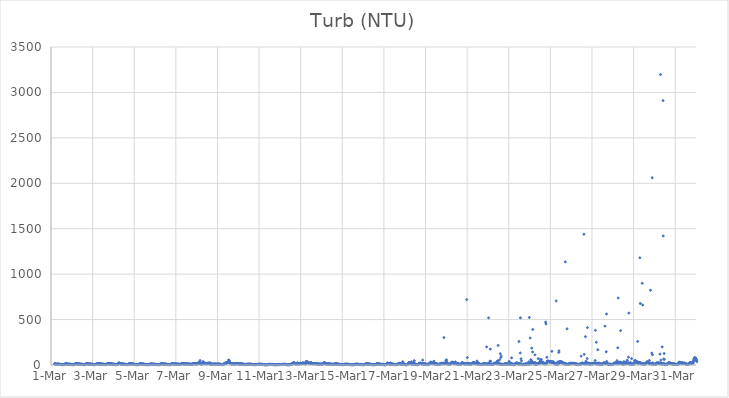
| Category | Turb (NTU) |
|---|---|
| 44621.166666666664 | 11.5 |
| 44621.177083333336 | 11.27 |
| 44621.1875 | 11.26 |
| 44621.197916666664 | 10.62 |
| 44621.208333333336 | 11.09 |
| 44621.21875 | 10.06 |
| 44621.229166666664 | 10.35 |
| 44621.239583333336 | 9.02 |
| 44621.25 | 8.74 |
| 44621.260416666664 | 7.86 |
| 44621.270833333336 | 7.4 |
| 44621.28125 | 7.75 |
| 44621.291666666664 | 8.08 |
| 44621.302083333336 | 8.36 |
| 44621.3125 | 8.98 |
| 44621.322916666664 | 9.12 |
| 44621.333333333336 | 9.79 |
| 44621.34375 | 9.59 |
| 44621.354166666664 | 9.75 |
| 44621.364583333336 | 8.4 |
| 44621.375 | 7.86 |
| 44621.385416666664 | 6.96 |
| 44621.395833333336 | 6.84 |
| 44621.40625 | 6.92 |
| 44621.416666666664 | 7.18 |
| 44621.427083333336 | 7.27 |
| 44621.4375 | 7 |
| 44621.447916666664 | 6.63 |
| 44621.458333333336 | 6.12 |
| 44621.46875 | 5.85 |
| 44621.479166666664 | 5.74 |
| 44621.489583333336 | 5.42 |
| 44621.5 | 5.26 |
| 44621.510416666664 | 4.78 |
| 44621.520833333336 | 4.65 |
| 44621.53125 | 4.64 |
| 44621.541666666664 | 5.19 |
| 44621.552083333336 | 4.26 |
| 44621.5625 | 4.34 |
| 44621.572916666664 | 4.15 |
| 44621.583333333336 | 4.18 |
| 44621.59375 | 4.02 |
| 44621.604166666664 | 4.15 |
| 44621.614583333336 | 4.47 |
| 44621.625 | 5.32 |
| 44621.635416666664 | 6.14 |
| 44621.645833333336 | 7.08 |
| 44621.65625 | 7.36 |
| 44621.666666666664 | 7.17 |
| 44621.677083333336 | 11.41 |
| 44621.6875 | 10.85 |
| 44621.697916666664 | 13.56 |
| 44621.708333333336 | 13.78 |
| 44621.71875 | 13.41 |
| 44621.729166666664 | 13.14 |
| 44621.739583333336 | 12.39 |
| 44621.75 | 12.72 |
| 44621.760416666664 | 11.3 |
| 44621.770833333336 | 10.16 |
| 44621.78125 | 9.52 |
| 44621.791666666664 | 9.02 |
| 44621.802083333336 | 8.08 |
| 44621.8125 | 8.77 |
| 44621.822916666664 | 8.82 |
| 44621.833333333336 | 8.54 |
| 44621.84375 | 8.23 |
| 44621.854166666664 | 8.05 |
| 44621.864583333336 | 7.72 |
| 44621.875 | 7.58 |
| 44621.885416666664 | 7.53 |
| 44621.895833333336 | 7.12 |
| 44621.90625 | 7.08 |
| 44621.916666666664 | 7.19 |
| 44621.927083333336 | 7.25 |
| 44621.9375 | 7.15 |
| 44621.947916666664 | 7.31 |
| 44621.958333333336 | 6.72 |
| 44621.96875 | 6.53 |
| 44621.979166666664 | 6.14 |
| 44621.989583333336 | 5.91 |
| 44622.0 | 5.55 |
| 44622.010416666664 | 5.07 |
| 44622.020833333336 | 4.63 |
| 44622.03125 | 4.59 |
| 44622.041666666664 | 4.27 |
| 44622.052083333336 | 4.54 |
| 44622.0625 | 4.33 |
| 44622.072916666664 | 4.22 |
| 44622.083333333336 | 3.94 |
| 44622.09375 | 4.53 |
| 44622.104166666664 | 5.8 |
| 44622.114583333336 | 5.73 |
| 44622.125 | 7.41 |
| 44622.135416666664 | 8.39 |
| 44622.145833333336 | 7.95 |
| 44622.15625 | 8.66 |
| 44622.166666666664 | 8.21 |
| 44622.177083333336 | 12.24 |
| 44622.1875 | 13.38 |
| 44622.197916666664 | 13.79 |
| 44622.208333333336 | 14.26 |
| 44622.21875 | 14.52 |
| 44622.229166666664 | 14.45 |
| 44622.239583333336 | 13.29 |
| 44622.25 | 12.29 |
| 44622.260416666664 | 12.23 |
| 44622.270833333336 | 11 |
| 44622.28125 | 10.53 |
| 44622.291666666664 | 9.96 |
| 44622.302083333336 | 9 |
| 44622.3125 | 8.88 |
| 44622.322916666664 | 10.13 |
| 44622.333333333336 | 10.14 |
| 44622.34375 | 10.22 |
| 44622.354166666664 | 10.72 |
| 44622.364583333336 | 11.79 |
| 44622.375 | 11.35 |
| 44622.385416666664 | 9.62 |
| 44622.395833333336 | 8.58 |
| 44622.40625 | 7.88 |
| 44622.416666666664 | 6.71 |
| 44622.427083333336 | 7.2 |
| 44622.4375 | 7.75 |
| 44622.447916666664 | 7.9 |
| 44622.458333333336 | 7.86 |
| 44622.46875 | 8.48 |
| 44622.479166666664 | 7.55 |
| 44622.489583333336 | 7.72 |
| 44622.5 | 6.83 |
| 44622.510416666664 | 6.32 |
| 44622.520833333336 | 5.69 |
| 44622.53125 | 5.13 |
| 44622.541666666664 | 4.85 |
| 44622.552083333336 | 4.87 |
| 44622.5625 | 4.51 |
| 44622.572916666664 | 4.76 |
| 44622.583333333336 | 4.31 |
| 44622.59375 | 4.36 |
| 44622.604166666664 | 4.06 |
| 44622.614583333336 | 3.98 |
| 44622.625 | 4.15 |
| 44622.635416666664 | 4.54 |
| 44622.645833333336 | 4.31 |
| 44622.65625 | 7.4 |
| 44622.666666666664 | 6.42 |
| 44622.677083333336 | 8.48 |
| 44622.6875 | 10.06 |
| 44622.697916666664 | 13.53 |
| 44622.708333333336 | 14.69 |
| 44622.71875 | 16.11 |
| 44622.729166666664 | 14.77 |
| 44622.739583333336 | 15.99 |
| 44622.75 | 15.02 |
| 44622.760416666664 | 13.7 |
| 44622.770833333336 | 13.28 |
| 44622.78125 | 11.51 |
| 44622.791666666664 | 10.31 |
| 44622.802083333336 | 10.42 |
| 44622.8125 | 9.73 |
| 44622.822916666664 | 9.88 |
| 44622.833333333336 | 8.73 |
| 44622.84375 | 8.34 |
| 44622.854166666664 | 9.05 |
| 44622.864583333336 | 9.12 |
| 44622.875 | 9.58 |
| 44622.885416666664 | 9.25 |
| 44622.895833333336 | 9.84 |
| 44622.90625 | 10.15 |
| 44622.916666666664 | 8.63 |
| 44622.927083333336 | 7.55 |
| 44622.9375 | 7.02 |
| 44622.947916666664 | 7.44 |
| 44622.958333333336 | 7.64 |
| 44622.96875 | 7.53 |
| 44622.979166666664 | 7.43 |
| 44622.989583333336 | 7.47 |
| 44623.0 | 7.04 |
| 44623.010416666664 | 6.32 |
| 44623.020833333336 | 5.99 |
| 44623.03125 | 5.67 |
| 44623.041666666664 | 4.83 |
| 44623.052083333336 | 4.64 |
| 44623.0625 | 4.54 |
| 44623.072916666664 | 4.4 |
| 44623.083333333336 | 4.21 |
| 44623.09375 | 4.26 |
| 44623.104166666664 | 4.15 |
| 44623.114583333336 | 4.04 |
| 44623.125 | 5.18 |
| 44623.135416666664 | 4.85 |
| 44623.145833333336 | 5.91 |
| 44623.15625 | 8.36 |
| 44623.166666666664 | 8.13 |
| 44623.177083333336 | 9.79 |
| 44623.1875 | 8.08 |
| 44623.197916666664 | 9.12 |
| 44623.208333333336 | 11.81 |
| 44623.21875 | 12.69 |
| 44623.229166666664 | 12.42 |
| 44623.239583333336 | 15.21 |
| 44623.25 | 14.93 |
| 44623.260416666664 | 14.81 |
| 44623.270833333336 | 13.54 |
| 44623.28125 | 14.08 |
| 44623.291666666664 | 12.9 |
| 44623.302083333336 | 13.36 |
| 44623.3125 | 12.83 |
| 44623.322916666664 | 11.65 |
| 44623.333333333336 | 10.1 |
| 44623.34375 | 9.81 |
| 44623.354166666664 | 9.62 |
| 44623.364583333336 | 11.46 |
| 44623.375 | 10.98 |
| 44623.385416666664 | 10.92 |
| 44623.395833333336 | 14.46 |
| 44623.40625 | 12.88 |
| 44623.416666666664 | 11.47 |
| 44623.427083333336 | 10.13 |
| 44623.4375 | 8.34 |
| 44623.447916666664 | 8.07 |
| 44623.458333333336 | 7.6 |
| 44623.46875 | 7.57 |
| 44623.479166666664 | 7.3 |
| 44623.489583333336 | 8.12 |
| 44623.5 | 7.89 |
| 44623.510416666664 | 7.85 |
| 44623.520833333336 | 7.37 |
| 44623.53125 | 6.95 |
| 44623.541666666664 | 6.97 |
| 44623.552083333336 | 6.22 |
| 44623.5625 | 6.03 |
| 44623.572916666664 | 5.53 |
| 44623.583333333336 | 5.26 |
| 44623.59375 | 5.18 |
| 44623.604166666664 | 5.02 |
| 44623.614583333336 | 4.47 |
| 44623.625 | 4.47 |
| 44623.635416666664 | 4.48 |
| 44623.645833333336 | 5.55 |
| 44623.65625 | 5.15 |
| 44623.666666666664 | 8.59 |
| 44623.677083333336 | 7.36 |
| 44623.6875 | 7.91 |
| 44623.697916666664 | 11.17 |
| 44623.708333333336 | 13.15 |
| 44623.71875 | 14.97 |
| 44623.729166666664 | 13.98 |
| 44623.739583333336 | 14.13 |
| 44623.75 | 15.02 |
| 44623.760416666664 | 14.78 |
| 44623.770833333336 | 14.6 |
| 44623.78125 | 14.14 |
| 44623.791666666664 | 14.26 |
| 44623.802083333336 | 13.19 |
| 44623.8125 | 12.73 |
| 44623.822916666664 | 11.52 |
| 44623.833333333336 | 12.34 |
| 44623.84375 | 12.21 |
| 44623.854166666664 | 10.45 |
| 44623.864583333336 | 10.47 |
| 44623.875 | 11.35 |
| 44623.885416666664 | 12.6 |
| 44623.895833333336 | 12.47 |
| 44623.90625 | 14.37 |
| 44623.916666666664 | 13.07 |
| 44623.927083333336 | 11.7 |
| 44623.9375 | 10.17 |
| 44623.947916666664 | 9.44 |
| 44623.958333333336 | 8.44 |
| 44623.96875 | 7.73 |
| 44623.979166666664 | 7.38 |
| 44623.989583333336 | 7.97 |
| 44624.0 | 7.94 |
| 44624.010416666664 | 8.13 |
| 44624.020833333336 | 7.81 |
| 44624.03125 | 7.72 |
| 44624.041666666664 | 7.06 |
| 44624.052083333336 | 6.65 |
| 44624.0625 | 6.23 |
| 44624.072916666664 | 5.83 |
| 44624.083333333336 | 5.09 |
| 44624.09375 | 5.45 |
| 44624.104166666664 | 5.08 |
| 44624.114583333336 | 5.03 |
| 44624.125 | 4.84 |
| 44624.135416666664 | 4.63 |
| 44624.145833333336 | 4.68 |
| 44624.15625 | 4.92 |
| 44624.166666666664 | 5.62 |
| 44624.177083333336 | 8.63 |
| 44624.1875 | 8.35 |
| 44624.197916666664 | 7.75 |
| 44624.208333333336 | 7.98 |
| 44624.21875 | 9.61 |
| 44624.229166666664 | 10.4 |
| 44624.239583333336 | 13.58 |
| 44624.25 | 19.23 |
| 44624.260416666664 | 21.74 |
| 44624.270833333336 | 21.82 |
| 44624.28125 | 19.74 |
| 44624.291666666664 | 17.58 |
| 44624.302083333336 | 16.8 |
| 44624.3125 | 15.77 |
| 44624.322916666664 | 14.65 |
| 44624.333333333336 | 14.99 |
| 44624.34375 | 12.66 |
| 44624.354166666664 | 11.54 |
| 44624.364583333336 | 11.02 |
| 44624.375 | 10 |
| 44624.385416666664 | 10.64 |
| 44624.395833333336 | 10.8 |
| 44624.40625 | 10.48 |
| 44624.416666666664 | 10.32 |
| 44624.427083333336 | 11.95 |
| 44624.4375 | 11.79 |
| 44624.447916666664 | 11.05 |
| 44624.458333333336 | 9.7 |
| 44624.46875 | 8.66 |
| 44624.479166666664 | 8.61 |
| 44624.489583333336 | 8.64 |
| 44624.5 | 8.16 |
| 44624.510416666664 | 7.91 |
| 44624.520833333336 | 8.24 |
| 44624.53125 | 8.15 |
| 44624.541666666664 | 7.88 |
| 44624.552083333336 | 7.51 |
| 44624.5625 | 6.92 |
| 44624.572916666664 | 6.62 |
| 44624.583333333336 | 6.2 |
| 44624.59375 | 5.54 |
| 44624.604166666664 | 5.43 |
| 44624.614583333336 | 5.19 |
| 44624.625 | 5.37 |
| 44624.635416666664 | 5.01 |
| 44624.645833333336 | 4.7 |
| 44624.65625 | 4.54 |
| 44624.666666666664 | 4.36 |
| 44624.677083333336 | 5.34 |
| 44624.6875 | 5.63 |
| 44624.697916666664 | 6.59 |
| 44624.708333333336 | 6.41 |
| 44624.71875 | 7.85 |
| 44624.729166666664 | 9.52 |
| 44624.739583333336 | 10.85 |
| 44624.75 | 11.52 |
| 44624.760416666664 | 12.6 |
| 44624.770833333336 | 12.27 |
| 44624.78125 | 12.53 |
| 44624.791666666664 | 14.69 |
| 44624.802083333336 | 18.13 |
| 44624.8125 | 13.02 |
| 44624.822916666664 | 13.05 |
| 44624.833333333336 | 12.81 |
| 44624.84375 | 11.13 |
| 44624.854166666664 | 10.99 |
| 44624.864583333336 | 10.48 |
| 44624.875 | 10.69 |
| 44624.885416666664 | 9.62 |
| 44624.895833333336 | 9.48 |
| 44624.90625 | 9.96 |
| 44624.916666666664 | 10.5 |
| 44624.927083333336 | 10.34 |
| 44624.9375 | 9.76 |
| 44624.947916666664 | 10.47 |
| 44624.958333333336 | 9.27 |
| 44624.96875 | 7.9 |
| 44624.979166666664 | 7.68 |
| 44624.989583333336 | 6.53 |
| 44625.0 | 6.1 |
| 44625.010416666664 | 6.26 |
| 44625.020833333336 | 5.97 |
| 44625.03125 | 5.74 |
| 44625.041666666664 | 5.68 |
| 44625.052083333336 | 5.66 |
| 44625.0625 | 5.41 |
| 44625.072916666664 | 5.37 |
| 44625.083333333336 | 5.06 |
| 44625.09375 | 4.97 |
| 44625.104166666664 | 4.46 |
| 44625.114583333336 | 4.45 |
| 44625.125 | 4.46 |
| 44625.135416666664 | 4.32 |
| 44625.145833333336 | 4.25 |
| 44625.15625 | 4.24 |
| 44625.166666666664 | 4.08 |
| 44625.177083333336 | 4.41 |
| 44625.1875 | 5.15 |
| 44625.197916666664 | 5.85 |
| 44625.208333333336 | 7.17 |
| 44625.21875 | 7.43 |
| 44625.229166666664 | 7.57 |
| 44625.239583333336 | 7.34 |
| 44625.25 | 7.43 |
| 44625.260416666664 | 7.61 |
| 44625.270833333336 | 12.53 |
| 44625.28125 | 12.81 |
| 44625.291666666664 | 13.25 |
| 44625.302083333336 | 13.53 |
| 44625.3125 | 12.77 |
| 44625.322916666664 | 12.68 |
| 44625.333333333336 | 12.48 |
| 44625.34375 | 12.14 |
| 44625.354166666664 | 11.46 |
| 44625.364583333336 | 10.14 |
| 44625.375 | 10.05 |
| 44625.385416666664 | 8.93 |
| 44625.395833333336 | 9 |
| 44625.40625 | 7.91 |
| 44625.416666666664 | 9.4 |
| 44625.427083333336 | 9.51 |
| 44625.4375 | 9.03 |
| 44625.447916666664 | 8.44 |
| 44625.458333333336 | 8.86 |
| 44625.46875 | 9.16 |
| 44625.479166666664 | 8.14 |
| 44625.489583333336 | 7.36 |
| 44625.5 | 6.48 |
| 44625.510416666664 | 5.81 |
| 44625.520833333336 | 5.38 |
| 44625.53125 | 5.16 |
| 44625.541666666664 | 4.9 |
| 44625.552083333336 | 4.72 |
| 44625.5625 | 4.95 |
| 44625.572916666664 | 5.05 |
| 44625.583333333336 | 5.06 |
| 44625.59375 | 4.77 |
| 44625.604166666664 | 4.82 |
| 44625.614583333336 | 4.48 |
| 44625.625 | 4.39 |
| 44625.635416666664 | 4.25 |
| 44625.645833333336 | 4.08 |
| 44625.65625 | 4.26 |
| 44625.666666666664 | 4 |
| 44625.677083333336 | 3.67 |
| 44625.6875 | 3.83 |
| 44625.697916666664 | 4.41 |
| 44625.708333333336 | 4.45 |
| 44625.71875 | 5.39 |
| 44625.729166666664 | 5.85 |
| 44625.739583333336 | 6.31 |
| 44625.75 | 6.91 |
| 44625.760416666664 | 8.62 |
| 44625.770833333336 | 10.64 |
| 44625.78125 | 10.44 |
| 44625.791666666664 | 9.61 |
| 44625.802083333336 | 10.18 |
| 44625.8125 | 10.04 |
| 44625.822916666664 | 10.04 |
| 44625.833333333336 | 9.22 |
| 44625.84375 | 9.44 |
| 44625.854166666664 | 9.28 |
| 44625.864583333336 | 9.17 |
| 44625.875 | 8.09 |
| 44625.885416666664 | 8.03 |
| 44625.895833333336 | 7.98 |
| 44625.90625 | 7.47 |
| 44625.916666666664 | 7.4 |
| 44625.927083333336 | 9.1 |
| 44625.9375 | 8.92 |
| 44625.947916666664 | 8.42 |
| 44625.958333333336 | 8.29 |
| 44625.96875 | 8.74 |
| 44625.979166666664 | 8.09 |
| 44625.989583333336 | 7.44 |
| 44626.0 | 6.73 |
| 44626.010416666664 | 6.02 |
| 44626.020833333336 | 5.85 |
| 44626.03125 | 5.58 |
| 44626.041666666664 | 5.48 |
| 44626.052083333336 | 5.26 |
| 44626.0625 | 5.49 |
| 44626.072916666664 | 5.69 |
| 44626.083333333336 | 5.41 |
| 44626.09375 | 5.77 |
| 44626.104166666664 | 5.24 |
| 44626.114583333336 | 5.02 |
| 44626.125 | 4.78 |
| 44626.135416666664 | 4.52 |
| 44626.145833333336 | 4.27 |
| 44626.15625 | 4.25 |
| 44626.166666666664 | 4.16 |
| 44626.177083333336 | 4.05 |
| 44626.1875 | 4.03 |
| 44626.197916666664 | 3.9 |
| 44626.208333333336 | 3.9 |
| 44626.21875 | 4.31 |
| 44626.229166666664 | 6.67 |
| 44626.239583333336 | 7.37 |
| 44626.25 | 8.54 |
| 44626.260416666664 | 9.59 |
| 44626.270833333336 | 9.76 |
| 44626.28125 | 8.66 |
| 44626.291666666664 | 11.56 |
| 44626.302083333336 | 11.98 |
| 44626.3125 | 14.29 |
| 44626.322916666664 | 14.75 |
| 44626.333333333336 | 14.61 |
| 44626.34375 | 12.95 |
| 44626.354166666664 | 12.4 |
| 44626.364583333336 | 11.82 |
| 44626.375 | 11.31 |
| 44626.385416666664 | 11.67 |
| 44626.395833333336 | 10.78 |
| 44626.40625 | 10.05 |
| 44626.416666666664 | 9.66 |
| 44626.427083333336 | 8.69 |
| 44626.4375 | 8.26 |
| 44626.447916666664 | 8.65 |
| 44626.458333333336 | 9.65 |
| 44626.46875 | 9.23 |
| 44626.479166666664 | 9.28 |
| 44626.489583333336 | 9.28 |
| 44626.5 | 9.25 |
| 44626.510416666664 | 9.34 |
| 44626.520833333336 | 8.65 |
| 44626.53125 | 8.24 |
| 44626.541666666664 | 7.65 |
| 44626.552083333336 | 6.87 |
| 44626.5625 | 6.5 |
| 44626.572916666664 | 5.91 |
| 44626.583333333336 | 5.7 |
| 44626.59375 | 5.57 |
| 44626.604166666664 | 5.53 |
| 44626.614583333336 | 5.25 |
| 44626.625 | 5.21 |
| 44626.635416666664 | 5.09 |
| 44626.645833333336 | 4.85 |
| 44626.65625 | 4.87 |
| 44626.666666666664 | 4.31 |
| 44626.677083333336 | 4.4 |
| 44626.6875 | 4.4 |
| 44626.697916666664 | 4.1 |
| 44626.708333333336 | 4.07 |
| 44626.71875 | 4.18 |
| 44626.729166666664 | 4.42 |
| 44626.739583333336 | 4.91 |
| 44626.75 | 7.01 |
| 44626.760416666664 | 6.99 |
| 44626.770833333336 | 6.62 |
| 44626.78125 | 7.78 |
| 44626.791666666664 | 12.42 |
| 44626.802083333336 | 15.33 |
| 44626.8125 | 15.93 |
| 44626.822916666664 | 19.02 |
| 44626.833333333336 | 14.06 |
| 44626.84375 | 12.92 |
| 44626.854166666664 | 12.64 |
| 44626.864583333336 | 12.95 |
| 44626.875 | 12.73 |
| 44626.885416666664 | 10.78 |
| 44626.895833333336 | 12.03 |
| 44626.90625 | 11.06 |
| 44626.916666666664 | 10.74 |
| 44626.927083333336 | 10.11 |
| 44626.9375 | 9.58 |
| 44626.947916666664 | 9.52 |
| 44626.958333333336 | 10.23 |
| 44626.96875 | 10.58 |
| 44626.979166666664 | 10.3 |
| 44626.989583333336 | 10.54 |
| 44627.0 | 10.52 |
| 44627.010416666664 | 11.38 |
| 44627.020833333336 | 10.72 |
| 44627.03125 | 9.62 |
| 44627.041666666664 | 9.64 |
| 44627.052083333336 | 8.67 |
| 44627.0625 | 8.09 |
| 44627.072916666664 | 7.84 |
| 44627.083333333336 | 7.62 |
| 44627.09375 | 8.25 |
| 44627.104166666664 | 8.5 |
| 44627.114583333336 | 8.62 |
| 44627.125 | 8.76 |
| 44627.135416666664 | 8.06 |
| 44627.145833333336 | 7.6 |
| 44627.15625 | 7.47 |
| 44627.166666666664 | 7.71 |
| 44627.177083333336 | 6.72 |
| 44627.1875 | 6.13 |
| 44627.197916666664 | 6.19 |
| 44627.208333333336 | 5.73 |
| 44627.21875 | 5.52 |
| 44627.229166666664 | 5.64 |
| 44627.239583333336 | 7.52 |
| 44627.25 | 9.05 |
| 44627.260416666664 | 10.43 |
| 44627.270833333336 | 10.63 |
| 44627.28125 | 13.36 |
| 44627.291666666664 | 15.01 |
| 44627.302083333336 | 17.08 |
| 44627.3125 | 16.48 |
| 44627.322916666664 | 14.99 |
| 44627.333333333336 | 14.73 |
| 44627.34375 | 13.85 |
| 44627.354166666664 | 12.26 |
| 44627.364583333336 | 11.52 |
| 44627.375 | 12.06 |
| 44627.385416666664 | 11.55 |
| 44627.395833333336 | 13.43 |
| 44627.40625 | 10.39 |
| 44627.416666666664 | 11.66 |
| 44627.427083333336 | 11.02 |
| 44627.4375 | 10.98 |
| 44627.447916666664 | 11.01 |
| 44627.458333333336 | 10.93 |
| 44627.46875 | 10.42 |
| 44627.479166666664 | 10.26 |
| 44627.489583333336 | 10.6 |
| 44627.5 | 10.41 |
| 44627.510416666664 | 9.96 |
| 44627.520833333336 | 9.65 |
| 44627.53125 | 10.41 |
| 44627.541666666664 | 10.43 |
| 44627.552083333336 | 10.45 |
| 44627.5625 | 10.44 |
| 44627.572916666664 | 10.57 |
| 44627.583333333336 | 10.06 |
| 44627.59375 | 9.56 |
| 44627.604166666664 | 9.51 |
| 44627.614583333336 | 9.75 |
| 44627.625 | 9.76 |
| 44627.635416666664 | 9.95 |
| 44627.645833333336 | 8.92 |
| 44627.65625 | 8.16 |
| 44627.666666666664 | 8.1 |
| 44627.677083333336 | 8.48 |
| 44627.6875 | 7.97 |
| 44627.697916666664 | 7.71 |
| 44627.708333333336 | 7.32 |
| 44627.71875 | 6.74 |
| 44627.729166666664 | 5.76 |
| 44627.739583333336 | 6.7 |
| 44627.75 | 6.66 |
| 44627.760416666664 | 7.84 |
| 44627.770833333336 | 8.93 |
| 44627.78125 | 9.84 |
| 44627.791666666664 | 11.17 |
| 44627.802083333336 | 12.2 |
| 44627.8125 | 10.61 |
| 44627.822916666664 | 10.75 |
| 44627.833333333336 | 11.75 |
| 44627.84375 | 13.96 |
| 44627.854166666664 | 14.08 |
| 44627.864583333336 | 15.2 |
| 44627.875 | 14.46 |
| 44627.885416666664 | 14.52 |
| 44627.895833333336 | 13.85 |
| 44627.90625 | 13.91 |
| 44627.916666666664 | 14.04 |
| 44627.927083333336 | 13.68 |
| 44627.9375 | 12.8 |
| 44627.947916666664 | 12.26 |
| 44627.958333333336 | 12.69 |
| 44627.96875 | 14.2 |
| 44627.979166666664 | 13.65 |
| 44627.989583333336 | 12.02 |
| 44628.0 | 11.59 |
| 44628.010416666664 | 12.31 |
| 44628.020833333336 | 12.81 |
| 44628.03125 | 12.61 |
| 44628.041666666664 | 13.35 |
| 44628.052083333336 | 15.85 |
| 44628.0625 | 18.67 |
| 44628.072916666664 | 23.66 |
| 44628.083333333336 | 23.48 |
| 44628.09375 | 24.72 |
| 44628.104166666664 | 25.13 |
| 44628.114583333336 | 24.02 |
| 44628.125 | 24.48 |
| 44628.135416666664 | 24.7 |
| 44628.145833333336 | 20.63 |
| 44628.15625 | 19.4 |
| 44628.166666666664 | 49.35 |
| 44628.177083333336 | 12.37 |
| 44628.1875 | 13.45 |
| 44628.197916666664 | 13.07 |
| 44628.208333333336 | 12.92 |
| 44628.21875 | 12.35 |
| 44628.229166666664 | 9.91 |
| 44628.239583333336 | 9.52 |
| 44628.25 | 9.67 |
| 44628.260416666664 | 9.86 |
| 44628.270833333336 | 13.43 |
| 44628.28125 | 17.11 |
| 44628.291666666664 | 25.42 |
| 44628.302083333336 | 34.94 |
| 44628.3125 | 33.53 |
| 44628.322916666664 | 31.15 |
| 44628.333333333336 | 26.38 |
| 44628.34375 | 22.9 |
| 44628.354166666664 | 20.33 |
| 44628.364583333336 | 16.73 |
| 44628.375 | 15.42 |
| 44628.385416666664 | 16.32 |
| 44628.395833333336 | 16.53 |
| 44628.40625 | 16.56 |
| 44628.416666666664 | 15.49 |
| 44628.427083333336 | 17.78 |
| 44628.4375 | 17.72 |
| 44628.447916666664 | 16.16 |
| 44628.458333333336 | 14.85 |
| 44628.46875 | 13.06 |
| 44628.479166666664 | 13.1 |
| 44628.489583333336 | 14.46 |
| 44628.5 | 13.62 |
| 44628.510416666664 | 14.96 |
| 44628.520833333336 | 17.22 |
| 44628.53125 | 18.79 |
| 44628.541666666664 | 17.53 |
| 44628.552083333336 | 15.99 |
| 44628.5625 | 20.34 |
| 44628.572916666664 | 18.25 |
| 44628.583333333336 | 19.83 |
| 44628.59375 | 17.95 |
| 44628.604166666664 | 14.7 |
| 44628.614583333336 | 13.59 |
| 44628.625 | 12.5 |
| 44628.635416666664 | 25.61 |
| 44628.645833333336 | 12.04 |
| 44628.65625 | 12.08 |
| 44628.666666666664 | 11.77 |
| 44628.677083333336 | 10.81 |
| 44628.6875 | 11.27 |
| 44628.697916666664 | 10.44 |
| 44628.708333333336 | 10.08 |
| 44628.71875 | 9.65 |
| 44628.729166666664 | 9.59 |
| 44628.739583333336 | 9.19 |
| 44628.75 | 8.5 |
| 44628.760416666664 | 8.31 |
| 44628.770833333336 | 7.58 |
| 44628.78125 | 7.58 |
| 44628.791666666664 | 7.51 |
| 44628.802083333336 | 7.61 |
| 44628.8125 | 8.21 |
| 44628.822916666664 | 7.89 |
| 44628.833333333336 | 8.54 |
| 44628.84375 | 9.44 |
| 44628.854166666664 | 10.35 |
| 44628.864583333336 | 10.93 |
| 44628.875 | 10.66 |
| 44628.885416666664 | 9.59 |
| 44628.895833333336 | 9.28 |
| 44628.90625 | 8.82 |
| 44628.916666666664 | 8.52 |
| 44628.927083333336 | 8.64 |
| 44628.9375 | 8.7 |
| 44628.947916666664 | 8.94 |
| 44628.958333333336 | 9.59 |
| 44628.96875 | 9.74 |
| 44628.979166666664 | 8.86 |
| 44628.989583333336 | 8.67 |
| 44629.0 | 8.65 |
| 44629.010416666664 | 8.26 |
| 44629.020833333336 | 8.69 |
| 44629.03125 | 9.07 |
| 44629.041666666664 | 8.81 |
| 44629.052083333336 | 8.14 |
| 44629.0625 | 8.95 |
| 44629.072916666664 | 9.47 |
| 44629.083333333336 | 9.13 |
| 44629.09375 | 8.8 |
| 44629.104166666664 | 8.3 |
| 44629.114583333336 | 8.02 |
| 44629.125 | 8.03 |
| 44629.135416666664 | 7.51 |
| 44629.145833333336 | 6.92 |
| 44629.15625 | 6.46 |
| 44629.166666666664 | 5.74 |
| 44629.177083333336 | 6.14 |
| 44629.1875 | 5.83 |
| 44629.197916666664 | 5.36 |
| 44629.208333333336 | 5.06 |
| 44629.21875 | 5.31 |
| 44629.229166666664 | 5.06 |
| 44629.239583333336 | 4.73 |
| 44629.25 | 5.09 |
| 44629.260416666664 | 4.67 |
| 44629.270833333336 | 4.3 |
| 44629.28125 | 4.41 |
| 44629.291666666664 | 6.88 |
| 44629.302083333336 | 6.52 |
| 44629.3125 | 12.8 |
| 44629.322916666664 | 11.41 |
| 44629.333333333336 | 12.7 |
| 44629.34375 | 14.83 |
| 44629.354166666664 | 20.43 |
| 44629.364583333336 | 19.48 |
| 44629.375 | 19.43 |
| 44629.385416666664 | 19.87 |
| 44629.395833333336 | 18.68 |
| 44629.40625 | 19.19 |
| 44629.416666666664 | 21.38 |
| 44629.427083333336 | 20.7 |
| 44629.4375 | 24.22 |
| 44629.447916666664 | 26.05 |
| 44629.458333333336 | 29.16 |
| 44629.46875 | 26.2 |
| 44629.479166666664 | 27.23 |
| 44629.489583333336 | 24.91 |
| 44629.5 | 24.59 |
| 44629.510416666664 | 31.48 |
| 44629.520833333336 | 33.77 |
| 44629.53125 | 37.91 |
| 44629.541666666664 | 55.38 |
| 44629.552083333336 | 52.92 |
| 44629.5625 | 45.28 |
| 44629.572916666664 | 41.42 |
| 44629.583333333336 | 28.11 |
| 44629.59375 | 25.99 |
| 44629.604166666664 | 22.99 |
| 44629.614583333336 | 21.33 |
| 44629.625 | 17.63 |
| 44629.635416666664 | 16.31 |
| 44629.645833333336 | 15.01 |
| 44629.65625 | 14.09 |
| 44629.666666666664 | 13.32 |
| 44629.677083333336 | 12.56 |
| 44629.6875 | 12.98 |
| 44629.697916666664 | 12.46 |
| 44629.708333333336 | 12.7 |
| 44629.71875 | 13.75 |
| 44629.729166666664 | 13.37 |
| 44629.739583333336 | 12.5 |
| 44629.75 | 11.17 |
| 44629.760416666664 | 11.44 |
| 44629.770833333336 | 9.91 |
| 44629.78125 | 9.21 |
| 44629.791666666664 | 9.33 |
| 44629.802083333336 | 10.71 |
| 44629.8125 | 10.54 |
| 44629.822916666664 | 13.07 |
| 44629.833333333336 | 13.4 |
| 44629.84375 | 15.98 |
| 44629.854166666664 | 14.55 |
| 44629.864583333336 | 13.8 |
| 44629.875 | 14.54 |
| 44629.885416666664 | 13.86 |
| 44629.895833333336 | 12.57 |
| 44629.90625 | 14.59 |
| 44629.916666666664 | 12.9 |
| 44629.927083333336 | 16.67 |
| 44629.9375 | 16.6 |
| 44629.947916666664 | 15.64 |
| 44629.958333333336 | 14.99 |
| 44629.96875 | 15.12 |
| 44629.979166666664 | 14.26 |
| 44629.989583333336 | 13.95 |
| 44630.0 | 13.22 |
| 44630.010416666664 | 11.75 |
| 44630.020833333336 | 11.91 |
| 44630.03125 | 11.49 |
| 44630.041666666664 | 11.8 |
| 44630.052083333336 | 10.88 |
| 44630.0625 | 10.64 |
| 44630.072916666664 | 10.9 |
| 44630.083333333336 | 10.39 |
| 44630.09375 | 10.79 |
| 44630.104166666664 | 11.16 |
| 44630.114583333336 | 10.2 |
| 44630.125 | 12.43 |
| 44630.135416666664 | 12.39 |
| 44630.145833333336 | 11.2 |
| 44630.15625 | 10.97 |
| 44630.166666666664 | 11.73 |
| 44630.177083333336 | 11.56 |
| 44630.1875 | 10.27 |
| 44630.197916666664 | 9.91 |
| 44630.208333333336 | 9.74 |
| 44630.21875 | 8.84 |
| 44630.229166666664 | 8.19 |
| 44630.239583333336 | 7.59 |
| 44630.25 | 7.63 |
| 44630.260416666664 | 7.01 |
| 44630.270833333336 | 6.95 |
| 44630.28125 | 6.26 |
| 44630.291666666664 | 6.77 |
| 44630.302083333336 | 6.03 |
| 44630.3125 | 5.48 |
| 44630.322916666664 | 5.46 |
| 44630.333333333336 | 5.27 |
| 44630.34375 | 5.95 |
| 44630.354166666664 | 5.48 |
| 44630.364583333336 | 6.08 |
| 44630.375 | 6.4 |
| 44630.385416666664 | 6.56 |
| 44630.395833333336 | 6.66 |
| 44630.40625 | 6.54 |
| 44630.416666666664 | 6.56 |
| 44630.427083333336 | 6.69 |
| 44630.4375 | 6.96 |
| 44630.447916666664 | 7.27 |
| 44630.458333333336 | 7.97 |
| 44630.46875 | 7.74 |
| 44630.479166666664 | 7.79 |
| 44630.489583333336 | 7.79 |
| 44630.5 | 7.99 |
| 44630.510416666664 | 8.17 |
| 44630.520833333336 | 8.06 |
| 44630.53125 | 7.98 |
| 44630.541666666664 | 8.1 |
| 44630.552083333336 | 8.11 |
| 44630.5625 | 8.09 |
| 44630.572916666664 | 8.24 |
| 44630.583333333336 | 7.5 |
| 44630.59375 | 7.59 |
| 44630.604166666664 | 7.71 |
| 44630.614583333336 | 7.82 |
| 44630.625 | 7.56 |
| 44630.635416666664 | 7.49 |
| 44630.645833333336 | 6.7 |
| 44630.65625 | 6.41 |
| 44630.666666666664 | 5.99 |
| 44630.677083333336 | 5.51 |
| 44630.6875 | 5.32 |
| 44630.697916666664 | 5.15 |
| 44630.708333333336 | 5 |
| 44630.71875 | 4.83 |
| 44630.729166666664 | 4.85 |
| 44630.739583333336 | 4.65 |
| 44630.75 | 4.58 |
| 44630.760416666664 | 4.59 |
| 44630.770833333336 | 4.97 |
| 44630.78125 | 4.93 |
| 44630.791666666664 | 4.89 |
| 44630.802083333336 | 4.61 |
| 44630.8125 | 4.43 |
| 44630.822916666664 | 4.28 |
| 44630.833333333336 | 4.36 |
| 44630.84375 | 4.3 |
| 44630.854166666664 | 4.78 |
| 44630.864583333336 | 5.25 |
| 44630.875 | 5.43 |
| 44630.885416666664 | 5.35 |
| 44630.895833333336 | 5.81 |
| 44630.90625 | 5.28 |
| 44630.916666666664 | 6.02 |
| 44630.927083333336 | 6.44 |
| 44630.9375 | 6.68 |
| 44630.947916666664 | 6.68 |
| 44630.958333333336 | 6.95 |
| 44630.96875 | 7.16 |
| 44630.979166666664 | 7.12 |
| 44630.989583333336 | 7.24 |
| 44631.0 | 7.01 |
| 44631.010416666664 | 7.13 |
| 44631.020833333336 | 7.25 |
| 44631.03125 | 7.3 |
| 44631.041666666664 | 7.35 |
| 44631.052083333336 | 7.07 |
| 44631.0625 | 7.32 |
| 44631.072916666664 | 6.73 |
| 44631.083333333336 | 6.6 |
| 44631.09375 | 6.98 |
| 44631.104166666664 | 6.36 |
| 44631.114583333336 | 6.69 |
| 44631.125 | 7.61 |
| 44631.135416666664 | 6.55 |
| 44631.145833333336 | 7.27 |
| 44631.15625 | 6.84 |
| 44631.166666666664 | 6.27 |
| 44631.177083333336 | 5.91 |
| 44631.1875 | 5.62 |
| 44631.197916666664 | 5.69 |
| 44631.208333333336 | 4.89 |
| 44631.21875 | 4.6 |
| 44631.229166666664 | 4.51 |
| 44631.239583333336 | 4.26 |
| 44631.25 | 4.09 |
| 44631.260416666664 | 3.86 |
| 44631.270833333336 | 3.95 |
| 44631.28125 | 3.84 |
| 44631.291666666664 | 3.52 |
| 44631.302083333336 | 3.55 |
| 44631.3125 | 3.51 |
| 44631.322916666664 | 3.58 |
| 44631.333333333336 | 3.53 |
| 44631.34375 | 3.52 |
| 44631.354166666664 | 3.48 |
| 44631.364583333336 | 3.34 |
| 44631.375 | 3.38 |
| 44631.385416666664 | 3.46 |
| 44631.395833333336 | 3.73 |
| 44631.40625 | 3.65 |
| 44631.416666666664 | 4.08 |
| 44631.427083333336 | 4.15 |
| 44631.4375 | 4.37 |
| 44631.447916666664 | 4.62 |
| 44631.458333333336 | 5.02 |
| 44631.46875 | 5.23 |
| 44631.479166666664 | 5.07 |
| 44631.489583333336 | 6.66 |
| 44631.5 | 6.12 |
| 44631.510416666664 | 6.84 |
| 44631.520833333336 | 7.01 |
| 44631.53125 | 8.17 |
| 44631.541666666664 | 6.54 |
| 44631.552083333336 | 6.57 |
| 44631.5625 | 6.63 |
| 44631.572916666664 | 6.41 |
| 44631.583333333336 | 6.01 |
| 44631.59375 | 5.77 |
| 44631.604166666664 | 5.91 |
| 44631.614583333336 | 5.87 |
| 44631.625 | 5.79 |
| 44631.635416666664 | 5.76 |
| 44631.645833333336 | 5.72 |
| 44631.65625 | 5.47 |
| 44631.666666666664 | 5.2 |
| 44631.677083333336 | 4.98 |
| 44631.6875 | 4.86 |
| 44631.697916666664 | 4.61 |
| 44631.708333333336 | 4.74 |
| 44631.71875 | 4.86 |
| 44631.729166666664 | 4.58 |
| 44631.739583333336 | 4.08 |
| 44631.75 | 3.95 |
| 44631.760416666664 | 4.13 |
| 44631.770833333336 | 3.68 |
| 44631.78125 | 3.33 |
| 44631.791666666664 | 3.6 |
| 44631.802083333336 | 3.61 |
| 44631.8125 | 3.46 |
| 44631.822916666664 | 5.12 |
| 44631.833333333336 | 4.93 |
| 44631.84375 | 4.1 |
| 44631.854166666664 | 4.73 |
| 44631.864583333336 | 4.1 |
| 44631.875 | 3.62 |
| 44631.885416666664 | 3.8 |
| 44631.895833333336 | 4.27 |
| 44631.90625 | 4.21 |
| 44631.916666666664 | 4.01 |
| 44631.927083333336 | 4.8 |
| 44631.9375 | 4.98 |
| 44631.947916666664 | 4.74 |
| 44631.958333333336 | 4.66 |
| 44631.96875 | 4.44 |
| 44631.979166666664 | 4.7 |
| 44631.989583333336 | 4.98 |
| 44632.0 | 5.22 |
| 44632.010416666664 | 5.37 |
| 44632.020833333336 | 5.78 |
| 44632.03125 | 5.34 |
| 44632.041666666664 | 5.51 |
| 44632.052083333336 | 5.22 |
| 44632.0625 | 5.26 |
| 44632.072916666664 | 5.1 |
| 44632.083333333336 | 5.25 |
| 44632.09375 | 5.24 |
| 44632.104166666664 | 5 |
| 44632.114583333336 | 5.41 |
| 44632.125 | 5.65 |
| 44632.135416666664 | 5.64 |
| 44632.145833333336 | 5.77 |
| 44632.15625 | 5.97 |
| 44632.166666666664 | 6.56 |
| 44632.177083333336 | 6.97 |
| 44632.1875 | 6.43 |
| 44632.197916666664 | 6.98 |
| 44632.208333333336 | 7.32 |
| 44632.21875 | 7.46 |
| 44632.229166666664 | 6.4 |
| 44632.239583333336 | 6.4 |
| 44632.25 | 6.07 |
| 44632.260416666664 | 6.06 |
| 44632.270833333336 | 5.54 |
| 44632.28125 | 5.27 |
| 44632.291666666664 | 4.96 |
| 44632.302083333336 | 4.81 |
| 44632.3125 | 4.39 |
| 44632.322916666664 | 4.4 |
| 44632.333333333336 | 4.54 |
| 44632.34375 | 4.4 |
| 44632.354166666664 | 4.2 |
| 44632.364583333336 | 3.99 |
| 44632.375 | 4.21 |
| 44632.385416666664 | 3.97 |
| 44632.395833333336 | 4.11 |
| 44632.40625 | 3.82 |
| 44632.416666666664 | 3.67 |
| 44632.427083333336 | 3.71 |
| 44632.4375 | 3.75 |
| 44632.447916666664 | 3.8 |
| 44632.458333333336 | 4.12 |
| 44632.46875 | 4.19 |
| 44632.479166666664 | 4.45 |
| 44632.489583333336 | 4.54 |
| 44632.5 | 5.22 |
| 44632.510416666664 | 5.29 |
| 44632.520833333336 | 5.02 |
| 44632.53125 | 5.1 |
| 44632.541666666664 | 5.21 |
| 44632.552083333336 | 5.34 |
| 44632.5625 | 5.18 |
| 44632.572916666664 | 5.18 |
| 44632.583333333336 | 15.84 |
| 44632.59375 | 15.9 |
| 44632.604166666664 | 17.97 |
| 44632.614583333336 | 17.45 |
| 44632.625 | 18.56 |
| 44632.635416666664 | 19.94 |
| 44632.645833333336 | 20.87 |
| 44632.65625 | 23.74 |
| 44632.666666666664 | 21.61 |
| 44632.677083333336 | 24.68 |
| 44632.6875 | 24.21 |
| 44632.697916666664 | 22.52 |
| 44632.708333333336 | 19.98 |
| 44632.71875 | 20.13 |
| 44632.729166666664 | 15.93 |
| 44632.739583333336 | 13.49 |
| 44632.75 | 11.4 |
| 44632.760416666664 | 11.97 |
| 44632.770833333336 | 11.32 |
| 44632.78125 | 11.26 |
| 44632.791666666664 | 10 |
| 44632.802083333336 | 10.15 |
| 44632.8125 | 11.68 |
| 44632.822916666664 | 13 |
| 44632.833333333336 | 17.52 |
| 44632.84375 | 22.23 |
| 44632.854166666664 | 18.75 |
| 44632.864583333336 | 18.19 |
| 44632.875 | 16.38 |
| 44632.885416666664 | 11.69 |
| 44632.895833333336 | 11.86 |
| 44632.90625 | 12.64 |
| 44632.916666666664 | 12.46 |
| 44632.927083333336 | 13.26 |
| 44632.9375 | 12.27 |
| 44632.947916666664 | 13.66 |
| 44632.958333333336 | 12.45 |
| 44632.96875 | 12.62 |
| 44632.979166666664 | 16.1 |
| 44632.989583333336 | 19.4 |
| 44633.0 | 18.43 |
| 44633.010416666664 | 18.84 |
| 44633.020833333336 | 14.8 |
| 44633.03125 | 15.03 |
| 44633.041666666664 | 15.68 |
| 44633.052083333336 | 16.3 |
| 44633.0625 | 15.34 |
| 44633.072916666664 | 19.12 |
| 44633.083333333336 | 19.21 |
| 44633.09375 | 22.36 |
| 44633.104166666664 | 21.53 |
| 44633.114583333336 | 20.59 |
| 44633.125 | 19.61 |
| 44633.135416666664 | 19.41 |
| 44633.145833333336 | 16.89 |
| 44633.15625 | 14.75 |
| 44633.166666666664 | 15.44 |
| 44633.177083333336 | 16.17 |
| 44633.1875 | 15.38 |
| 44633.197916666664 | 16.21 |
| 44633.208333333336 | 15.04 |
| 44633.21875 | 12.29 |
| 44633.229166666664 | 12.67 |
| 44633.239583333336 | 14.14 |
| 44633.25 | 17.65 |
| 44633.260416666664 | 36.12 |
| 44633.270833333336 | 37.98 |
| 44633.28125 | 38.68 |
| 44633.291666666664 | 36.24 |
| 44633.302083333336 | 32.94 |
| 44633.3125 | 32.6 |
| 44633.322916666664 | 32.14 |
| 44633.333333333336 | 30.37 |
| 44633.34375 | 28.2 |
| 44633.354166666664 | 25.67 |
| 44633.364583333336 | 22.32 |
| 44633.375 | 23.81 |
| 44633.385416666664 | 23.69 |
| 44633.395833333336 | 21.96 |
| 44633.40625 | 20.78 |
| 44633.416666666664 | 21.54 |
| 44633.427083333336 | 17.16 |
| 44633.4375 | 16.35 |
| 44633.447916666664 | 17.16 |
| 44633.458333333336 | 15.44 |
| 44633.46875 | 17 |
| 44633.479166666664 | 18.91 |
| 44633.489583333336 | 25.81 |
| 44633.5 | 27.88 |
| 44633.510416666664 | 21.81 |
| 44633.520833333336 | 19.92 |
| 44633.53125 | 18.1 |
| 44633.541666666664 | 17.29 |
| 44633.552083333336 | 16.4 |
| 44633.5625 | 15.74 |
| 44633.572916666664 | 14.63 |
| 44633.583333333336 | 14.98 |
| 44633.59375 | 15.27 |
| 44633.604166666664 | 15.42 |
| 44633.614583333336 | 14.94 |
| 44633.625 | 15.5 |
| 44633.635416666664 | 15.47 |
| 44633.645833333336 | 15.73 |
| 44633.65625 | 16.1 |
| 44633.666666666664 | 15.86 |
| 44633.677083333336 | 15.47 |
| 44633.6875 | 15.65 |
| 44633.697916666664 | 15.86 |
| 44633.708333333336 | 15.71 |
| 44633.71875 | 15.05 |
| 44633.729166666664 | 14.46 |
| 44633.739583333336 | 14.46 |
| 44633.75 | 12.95 |
| 44633.760416666664 | 13.12 |
| 44633.770833333336 | 12.84 |
| 44633.78125 | 12.54 |
| 44633.791666666664 | 12.41 |
| 44633.802083333336 | 12.59 |
| 44633.8125 | 11.64 |
| 44633.822916666664 | 10.84 |
| 44633.833333333336 | 11.34 |
| 44633.84375 | 10.41 |
| 44633.854166666664 | 10.05 |
| 44633.864583333336 | 9.43 |
| 44633.875 | 9.36 |
| 44633.885416666664 | 8.84 |
| 44633.895833333336 | 8.83 |
| 44633.90625 | 8.54 |
| 44633.916666666664 | 8.81 |
| 44633.927083333336 | 8.67 |
| 44633.9375 | 9.48 |
| 44633.947916666664 | 9.35 |
| 44633.958333333336 | 8.74 |
| 44633.96875 | 8.43 |
| 44633.979166666664 | 8.12 |
| 44633.989583333336 | 8.41 |
| 44634.0 | 7.71 |
| 44634.010416666664 | 7.51 |
| 44634.020833333336 | 7.34 |
| 44634.03125 | 8.43 |
| 44634.041666666664 | 9.07 |
| 44634.052083333336 | 10.56 |
| 44634.0625 | 10.29 |
| 44634.072916666664 | 12.5 |
| 44634.083333333336 | 14.71 |
| 44634.09375 | 17.3 |
| 44634.104166666664 | 18.65 |
| 44634.114583333336 | 21.02 |
| 44634.125 | 21 |
| 44634.135416666664 | 26.73 |
| 44634.145833333336 | 18.22 |
| 44634.15625 | 21.02 |
| 44634.166666666664 | 25.87 |
| 44634.177083333336 | 15.87 |
| 44634.1875 | 15.45 |
| 44634.197916666664 | 15.04 |
| 44634.208333333336 | 14.24 |
| 44634.21875 | 14.79 |
| 44634.229166666664 | 12.49 |
| 44634.239583333336 | 11.48 |
| 44634.25 | 11.28 |
| 44634.260416666664 | 10.96 |
| 44634.270833333336 | 11.27 |
| 44634.28125 | 10.13 |
| 44634.291666666664 | 10.91 |
| 44634.302083333336 | 10.91 |
| 44634.3125 | 10.93 |
| 44634.322916666664 | 11.38 |
| 44634.333333333336 | 10.99 |
| 44634.34375 | 10.03 |
| 44634.354166666664 | 9.76 |
| 44634.364583333336 | 9.66 |
| 44634.375 | 9.91 |
| 44634.385416666664 | 10.75 |
| 44634.395833333336 | 10.13 |
| 44634.40625 | 9.36 |
| 44634.416666666664 | 9.77 |
| 44634.427083333336 | 9.54 |
| 44634.4375 | 9.17 |
| 44634.447916666664 | 8.55 |
| 44634.458333333336 | 8.37 |
| 44634.46875 | 8.37 |
| 44634.479166666664 | 8.32 |
| 44634.489583333336 | 8.15 |
| 44634.5 | 7.92 |
| 44634.510416666664 | 7.36 |
| 44634.520833333336 | 7.3 |
| 44634.53125 | 6.53 |
| 44634.541666666664 | 6.95 |
| 44634.552083333336 | 6.84 |
| 44634.5625 | 7.17 |
| 44634.572916666664 | 7.49 |
| 44634.583333333336 | 7.1 |
| 44634.59375 | 8.05 |
| 44634.604166666664 | 8.6 |
| 44634.614583333336 | 8.8 |
| 44634.625 | 9.03 |
| 44634.635416666664 | 9.32 |
| 44634.645833333336 | 9.88 |
| 44634.65625 | 10.85 |
| 44634.666666666664 | 11.38 |
| 44634.677083333336 | 10.53 |
| 44634.6875 | 10.9 |
| 44634.697916666664 | 11.1 |
| 44634.708333333336 | 11.16 |
| 44634.71875 | 12.2 |
| 44634.729166666664 | 12.13 |
| 44634.739583333336 | 12.44 |
| 44634.75 | 11.1 |
| 44634.760416666664 | 10.26 |
| 44634.770833333336 | 10.1 |
| 44634.78125 | 8.64 |
| 44634.791666666664 | 8.54 |
| 44634.802083333336 | 8.29 |
| 44634.8125 | 8.31 |
| 44634.822916666664 | 7.57 |
| 44634.833333333336 | 7.22 |
| 44634.84375 | 7.03 |
| 44634.854166666664 | 6.53 |
| 44634.864583333336 | 6.99 |
| 44634.875 | 6.26 |
| 44634.885416666664 | 6.18 |
| 44634.895833333336 | 6.39 |
| 44634.90625 | 5.87 |
| 44634.916666666664 | 5.74 |
| 44634.927083333336 | 5.43 |
| 44634.9375 | 5.42 |
| 44634.947916666664 | 5.18 |
| 44634.958333333336 | 5.35 |
| 44634.96875 | 5.53 |
| 44634.979166666664 | 5.04 |
| 44634.989583333336 | 4.66 |
| 44635.0 | 4.19 |
| 44635.010416666664 | 4.65 |
| 44635.020833333336 | 4.57 |
| 44635.03125 | 4.6 |
| 44635.041666666664 | 5.05 |
| 44635.052083333336 | 4.78 |
| 44635.0625 | 4.91 |
| 44635.072916666664 | 5.41 |
| 44635.083333333336 | 5.95 |
| 44635.09375 | 6.24 |
| 44635.104166666664 | 6.31 |
| 44635.114583333336 | 8.48 |
| 44635.125 | 7.5 |
| 44635.135416666664 | 7.47 |
| 44635.145833333336 | 7.44 |
| 44635.15625 | 7.79 |
| 44635.166666666664 | 7.94 |
| 44635.177083333336 | 7.97 |
| 44635.1875 | 8.45 |
| 44635.197916666664 | 8.37 |
| 44635.208333333336 | 7.59 |
| 44635.21875 | 7.67 |
| 44635.229166666664 | 7.87 |
| 44635.239583333336 | 7.26 |
| 44635.25 | 7.28 |
| 44635.260416666664 | 6.76 |
| 44635.270833333336 | 6.49 |
| 44635.28125 | 6.49 |
| 44635.291666666664 | 6.5 |
| 44635.302083333336 | 6.53 |
| 44635.3125 | 6.14 |
| 44635.322916666664 | 5.6 |
| 44635.333333333336 | 5.42 |
| 44635.34375 | 5.48 |
| 44635.354166666664 | 5.03 |
| 44635.364583333336 | 4.54 |
| 44635.375 | 4.48 |
| 44635.385416666664 | 4.42 |
| 44635.395833333336 | 4.5 |
| 44635.40625 | 4.14 |
| 44635.416666666664 | 3.99 |
| 44635.427083333336 | 4.12 |
| 44635.4375 | 3.99 |
| 44635.447916666664 | 4.34 |
| 44635.458333333336 | 4.07 |
| 44635.46875 | 3.84 |
| 44635.479166666664 | 3.62 |
| 44635.489583333336 | 3.73 |
| 44635.5 | 3.65 |
| 44635.510416666664 | 3.61 |
| 44635.520833333336 | 3.48 |
| 44635.53125 | 3.47 |
| 44635.541666666664 | 6.37 |
| 44635.552083333336 | 3.85 |
| 44635.5625 | 3.99 |
| 44635.572916666664 | 4.01 |
| 44635.583333333336 | 4.21 |
| 44635.59375 | 5.54 |
| 44635.604166666664 | 6.18 |
| 44635.614583333336 | 6.84 |
| 44635.625 | 6.85 |
| 44635.635416666664 | 7.58 |
| 44635.645833333336 | 7.65 |
| 44635.65625 | 7.47 |
| 44635.666666666664 | 7.32 |
| 44635.677083333336 | 7.47 |
| 44635.6875 | 7.75 |
| 44635.697916666664 | 7.87 |
| 44635.708333333336 | 8.07 |
| 44635.71875 | 7.96 |
| 44635.729166666664 | 6.78 |
| 44635.739583333336 | 7.1 |
| 44635.75 | 6.64 |
| 44635.760416666664 | 6.82 |
| 44635.770833333336 | 6.49 |
| 44635.78125 | 6.12 |
| 44635.791666666664 | 6.26 |
| 44635.802083333336 | 6.07 |
| 44635.8125 | 5.65 |
| 44635.822916666664 | 5.3 |
| 44635.833333333336 | 4.98 |
| 44635.84375 | 4.82 |
| 44635.854166666664 | 4.67 |
| 44635.864583333336 | 4.52 |
| 44635.875 | 4.51 |
| 44635.885416666664 | 4.77 |
| 44635.895833333336 | 4.58 |
| 44635.90625 | 4.58 |
| 44635.916666666664 | 4.55 |
| 44635.927083333336 | 4.97 |
| 44635.9375 | 4.62 |
| 44635.947916666664 | 4.77 |
| 44635.958333333336 | 4.74 |
| 44635.96875 | 4.35 |
| 44635.979166666664 | 4.11 |
| 44635.989583333336 | 4.19 |
| 44636.0 | 3.91 |
| 44636.010416666664 | 4.06 |
| 44636.020833333336 | 3.98 |
| 44636.03125 | 3.53 |
| 44636.041666666664 | 3.45 |
| 44636.052083333336 | 3.57 |
| 44636.0625 | 4.73 |
| 44636.072916666664 | 5.98 |
| 44636.083333333336 | 6.82 |
| 44636.09375 | 6.67 |
| 44636.104166666664 | 8.23 |
| 44636.114583333336 | 8.71 |
| 44636.125 | 10.17 |
| 44636.135416666664 | 11.52 |
| 44636.145833333336 | 12.75 |
| 44636.15625 | 13.21 |
| 44636.166666666664 | 12.57 |
| 44636.177083333336 | 12.23 |
| 44636.1875 | 11.74 |
| 44636.197916666664 | 11.84 |
| 44636.208333333336 | 12.07 |
| 44636.21875 | 11.55 |
| 44636.229166666664 | 10.58 |
| 44636.239583333336 | 10.32 |
| 44636.25 | 9.23 |
| 44636.260416666664 | 9.33 |
| 44636.270833333336 | 8.81 |
| 44636.28125 | 8.86 |
| 44636.291666666664 | 9.12 |
| 44636.302083333336 | 9.1 |
| 44636.3125 | 8.76 |
| 44636.322916666664 | 8.93 |
| 44636.333333333336 | 8.34 |
| 44636.34375 | 8.04 |
| 44636.354166666664 | 6.63 |
| 44636.364583333336 | 6.52 |
| 44636.375 | 5.39 |
| 44636.385416666664 | 5.31 |
| 44636.395833333336 | 5.67 |
| 44636.40625 | 5.16 |
| 44636.416666666664 | 4.65 |
| 44636.427083333336 | 5.06 |
| 44636.4375 | 5.67 |
| 44636.447916666664 | 4.32 |
| 44636.458333333336 | 4.33 |
| 44636.46875 | 4.36 |
| 44636.479166666664 | 4.17 |
| 44636.489583333336 | 3.91 |
| 44636.5 | 4.14 |
| 44636.510416666664 | 3.8 |
| 44636.520833333336 | 3.31 |
| 44636.53125 | 3.57 |
| 44636.541666666664 | 3.82 |
| 44636.552083333336 | 3.58 |
| 44636.5625 | 3.96 |
| 44636.572916666664 | 3.74 |
| 44636.583333333336 | 4.37 |
| 44636.59375 | 5.96 |
| 44636.604166666664 | 5.87 |
| 44636.614583333336 | 5.88 |
| 44636.625 | 5.87 |
| 44636.635416666664 | 8.79 |
| 44636.645833333336 | 12.86 |
| 44636.65625 | 14.99 |
| 44636.666666666664 | 13.4 |
| 44636.677083333336 | 15.52 |
| 44636.6875 | 14.88 |
| 44636.697916666664 | 13.84 |
| 44636.708333333336 | 12.32 |
| 44636.71875 | 11.68 |
| 44636.729166666664 | 10.98 |
| 44636.739583333336 | 10.96 |
| 44636.75 | 10.15 |
| 44636.760416666664 | 9.65 |
| 44636.770833333336 | 9.16 |
| 44636.78125 | 8.99 |
| 44636.791666666664 | 9.34 |
| 44636.802083333336 | 8.52 |
| 44636.8125 | 8.84 |
| 44636.822916666664 | 8.08 |
| 44636.833333333336 | 7.87 |
| 44636.84375 | 8.97 |
| 44636.854166666664 | 6.91 |
| 44636.864583333336 | 6.47 |
| 44636.875 | 6.03 |
| 44636.885416666664 | 6.4 |
| 44636.895833333336 | 6.19 |
| 44636.90625 | 5.98 |
| 44636.916666666664 | 6.37 |
| 44636.927083333336 | 7.04 |
| 44636.9375 | 6.46 |
| 44636.947916666664 | 6.19 |
| 44636.958333333336 | 5.23 |
| 44636.96875 | 6.38 |
| 44636.979166666664 | 4.49 |
| 44636.989583333336 | 3.96 |
| 44637.0 | 3.65 |
| 44637.010416666664 | 3.33 |
| 44637.020833333336 | 3.85 |
| 44637.03125 | 3.19 |
| 44637.041666666664 | 3.49 |
| 44637.052083333336 | 3.45 |
| 44637.0625 | 3.46 |
| 44637.072916666664 | 3.76 |
| 44637.083333333336 | 4.34 |
| 44637.09375 | 4.97 |
| 44637.104166666664 | 6.65 |
| 44637.114583333336 | 6.7 |
| 44637.125 | 7.5 |
| 44637.135416666664 | 10.71 |
| 44637.145833333336 | 14 |
| 44637.15625 | 19.62 |
| 44637.166666666664 | 15.76 |
| 44637.177083333336 | 20.35 |
| 44637.1875 | 21.89 |
| 44637.197916666664 | 18.3 |
| 44637.208333333336 | 17.7 |
| 44637.21875 | 16.22 |
| 44637.229166666664 | 14.38 |
| 44637.239583333336 | 13.44 |
| 44637.25 | 13.06 |
| 44637.260416666664 | 12.15 |
| 44637.270833333336 | 11.45 |
| 44637.28125 | 11.51 |
| 44637.291666666664 | 10.5 |
| 44637.302083333336 | 10.78 |
| 44637.3125 | 10.71 |
| 44637.322916666664 | 23.97 |
| 44637.333333333336 | 9.97 |
| 44637.34375 | 9.73 |
| 44637.354166666664 | 10.31 |
| 44637.364583333336 | 9.04 |
| 44637.375 | 8.77 |
| 44637.385416666664 | 8.54 |
| 44637.395833333336 | 8.19 |
| 44637.40625 | 8.79 |
| 44637.416666666664 | 9.53 |
| 44637.427083333336 | 8.74 |
| 44637.4375 | 8.7 |
| 44637.447916666664 | 6.96 |
| 44637.458333333336 | 7.36 |
| 44637.46875 | 6.96 |
| 44637.479166666664 | 7.68 |
| 44637.489583333336 | 5.51 |
| 44637.5 | 4.94 |
| 44637.510416666664 | 4.97 |
| 44637.520833333336 | 4.86 |
| 44637.53125 | 4.91 |
| 44637.541666666664 | 4.58 |
| 44637.552083333336 | 6.29 |
| 44637.5625 | 4.29 |
| 44637.572916666664 | 4.01 |
| 44637.583333333336 | 3.76 |
| 44637.59375 | 4.43 |
| 44637.604166666664 | 4.9 |
| 44637.614583333336 | 4.71 |
| 44637.625 | 5.32 |
| 44637.635416666664 | 5.7 |
| 44637.645833333336 | 7.11 |
| 44637.65625 | 8.72 |
| 44637.666666666664 | 9.41 |
| 44637.677083333336 | 9.94 |
| 44637.6875 | 10.56 |
| 44637.697916666664 | 10.62 |
| 44637.708333333336 | 11.21 |
| 44637.71875 | 12.01 |
| 44637.729166666664 | 14.12 |
| 44637.739583333336 | 17.01 |
| 44637.75 | 18.21 |
| 44637.760416666664 | 16.85 |
| 44637.770833333336 | 14.26 |
| 44637.78125 | 12.04 |
| 44637.791666666664 | 11.35 |
| 44637.802083333336 | 11.35 |
| 44637.8125 | 10.18 |
| 44637.822916666664 | 10.17 |
| 44637.833333333336 | 9.2 |
| 44637.84375 | 9.83 |
| 44637.854166666664 | 9.77 |
| 44637.864583333336 | 9.15 |
| 44637.875 | 9.4 |
| 44637.885416666664 | 9.4 |
| 44637.895833333336 | 8.12 |
| 44637.90625 | 35.84 |
| 44637.916666666664 | 10.67 |
| 44637.927083333336 | 11.9 |
| 44637.9375 | 11.88 |
| 44637.947916666664 | 11.71 |
| 44637.958333333336 | 8.35 |
| 44637.96875 | 7.95 |
| 44637.979166666664 | 6.28 |
| 44637.989583333336 | 10.63 |
| 44638.0 | 7.43 |
| 44638.010416666664 | 4.9 |
| 44638.020833333336 | 4.32 |
| 44638.03125 | 3.93 |
| 44638.041666666664 | 3.88 |
| 44638.052083333336 | 4.22 |
| 44638.0625 | 4.23 |
| 44638.072916666664 | 3.9 |
| 44638.083333333336 | 3.71 |
| 44638.09375 | 3.73 |
| 44638.104166666664 | 3.92 |
| 44638.114583333336 | 5.17 |
| 44638.125 | 5.87 |
| 44638.135416666664 | 7.52 |
| 44638.145833333336 | 8.29 |
| 44638.15625 | 9.46 |
| 44638.166666666664 | 11.5 |
| 44638.177083333336 | 15.13 |
| 44638.1875 | 17.32 |
| 44638.197916666664 | 25.08 |
| 44638.208333333336 | 26.66 |
| 44638.21875 | 24.44 |
| 44638.229166666664 | 26.33 |
| 44638.239583333336 | 23.84 |
| 44638.25 | 21.39 |
| 44638.260416666664 | 19.33 |
| 44638.270833333336 | 19.57 |
| 44638.28125 | 16.94 |
| 44638.291666666664 | 15.11 |
| 44638.302083333336 | 14.13 |
| 44638.3125 | 13.05 |
| 44638.322916666664 | 35.05 |
| 44638.333333333336 | 11.14 |
| 44638.34375 | 12.01 |
| 44638.354166666664 | 12.02 |
| 44638.364583333336 | 14.73 |
| 44638.375 | 14.63 |
| 44638.385416666664 | 11.21 |
| 44638.395833333336 | 12.74 |
| 44638.40625 | 9.06 |
| 44638.416666666664 | 11.43 |
| 44638.427083333336 | 11.54 |
| 44638.4375 | 6.52 |
| 44638.447916666664 | 32.23 |
| 44638.458333333336 | 47.94 |
| 44638.46875 | 11.06 |
| 44638.479166666664 | 8.41 |
| 44638.489583333336 | 10 |
| 44638.5 | 8.67 |
| 44638.510416666664 | 9.17 |
| 44638.520833333336 | 7.18 |
| 44638.53125 | 6.36 |
| 44638.541666666664 | 5.7 |
| 44638.552083333336 | 5.35 |
| 44638.5625 | 5.2 |
| 44638.572916666664 | 5.26 |
| 44638.583333333336 | 5.1 |
| 44638.59375 | 5.18 |
| 44638.604166666664 | 4.63 |
| 44638.614583333336 | 4.74 |
| 44638.625 | 5.19 |
| 44638.635416666664 | 6.18 |
| 44638.645833333336 | 7.17 |
| 44638.65625 | 9.99 |
| 44638.666666666664 | 14.5 |
| 44638.677083333336 | 15.34 |
| 44638.6875 | 12.59 |
| 44638.697916666664 | 14.4 |
| 44638.708333333336 | 16.88 |
| 44638.71875 | 17.66 |
| 44638.729166666664 | 19.2 |
| 44638.739583333336 | 20.82 |
| 44638.75 | 19.35 |
| 44638.760416666664 | 18.27 |
| 44638.770833333336 | 18.52 |
| 44638.78125 | 16.66 |
| 44638.791666666664 | 15.09 |
| 44638.802083333336 | 13.74 |
| 44638.8125 | 14.1 |
| 44638.822916666664 | 13.52 |
| 44638.833333333336 | 11.96 |
| 44638.84375 | 12.02 |
| 44638.854166666664 | 14.23 |
| 44638.864583333336 | 53.12 |
| 44638.875 | 11.78 |
| 44638.885416666664 | 13.05 |
| 44638.895833333336 | 10.58 |
| 44638.90625 | 11.22 |
| 44638.916666666664 | 13.54 |
| 44638.927083333336 | 11.82 |
| 44638.9375 | 10.85 |
| 44638.947916666664 | 12.74 |
| 44638.958333333336 | 10.22 |
| 44638.96875 | 12.36 |
| 44638.979166666664 | 7.98 |
| 44638.989583333336 | 15.21 |
| 44639.0 | 8.93 |
| 44639.010416666664 | 7.75 |
| 44639.020833333336 | 10.19 |
| 44639.03125 | 8.68 |
| 44639.041666666664 | 5.84 |
| 44639.052083333336 | 5.96 |
| 44639.0625 | 5.25 |
| 44639.072916666664 | 5.32 |
| 44639.083333333336 | 5.37 |
| 44639.09375 | 7.22 |
| 44639.104166666664 | 6.19 |
| 44639.114583333336 | 4.54 |
| 44639.125 | 4.54 |
| 44639.135416666664 | 4.4 |
| 44639.145833333336 | 8.53 |
| 44639.15625 | 9 |
| 44639.166666666664 | 9.06 |
| 44639.177083333336 | 12.46 |
| 44639.1875 | 16.52 |
| 44639.197916666664 | 11.17 |
| 44639.208333333336 | 14.38 |
| 44639.21875 | 19.82 |
| 44639.229166666664 | 20.99 |
| 44639.239583333336 | 26.65 |
| 44639.25 | 32.69 |
| 44639.260416666664 | 26.97 |
| 44639.270833333336 | 26.52 |
| 44639.28125 | 27.97 |
| 44639.291666666664 | 25.81 |
| 44639.302083333336 | 25.38 |
| 44639.3125 | 22.32 |
| 44639.322916666664 | 19.53 |
| 44639.333333333336 | 16.42 |
| 44639.34375 | 17.58 |
| 44639.354166666664 | 14.92 |
| 44639.364583333336 | 18.39 |
| 44639.375 | 18.06 |
| 44639.385416666664 | 17.1 |
| 44639.395833333336 | 18.72 |
| 44639.40625 | 41.79 |
| 44639.416666666664 | 13.69 |
| 44639.427083333336 | 12.53 |
| 44639.4375 | 14.45 |
| 44639.447916666664 | 13.33 |
| 44639.458333333336 | 12.78 |
| 44639.46875 | 13.62 |
| 44639.479166666664 | 16.5 |
| 44639.489583333336 | 10.76 |
| 44639.5 | 10.39 |
| 44639.510416666664 | 9.26 |
| 44639.520833333336 | 14.2 |
| 44639.53125 | 15.89 |
| 44639.541666666664 | 9.74 |
| 44639.552083333336 | 11.41 |
| 44639.5625 | 7.28 |
| 44639.572916666664 | 7.02 |
| 44639.583333333336 | 6.69 |
| 44639.59375 | 6.17 |
| 44639.604166666664 | 6.63 |
| 44639.614583333336 | 5.65 |
| 44639.625 | 5.41 |
| 44639.635416666664 | 5.43 |
| 44639.645833333336 | 4.85 |
| 44639.65625 | 6.72 |
| 44639.666666666664 | 8 |
| 44639.677083333336 | 9.92 |
| 44639.6875 | 10.3 |
| 44639.697916666664 | 12.07 |
| 44639.708333333336 | 10.98 |
| 44639.71875 | 10.85 |
| 44639.729166666664 | 11.37 |
| 44639.739583333336 | 13.26 |
| 44639.75 | 14.91 |
| 44639.760416666664 | 16.83 |
| 44639.770833333336 | 17.41 |
| 44639.78125 | 18.27 |
| 44639.791666666664 | 18.4 |
| 44639.802083333336 | 16.36 |
| 44639.8125 | 17.08 |
| 44639.822916666664 | 15.08 |
| 44639.833333333336 | 14.59 |
| 44639.84375 | 16.02 |
| 44639.854166666664 | 13.83 |
| 44639.864583333336 | 17.72 |
| 44639.875 | 20.66 |
| 44639.885416666664 | 301.86 |
| 44639.895833333336 | 11.82 |
| 44639.90625 | 19.12 |
| 44639.916666666664 | 16.72 |
| 44639.927083333336 | 15.89 |
| 44639.9375 | 14.67 |
| 44639.947916666664 | 16.17 |
| 44639.958333333336 | 17.28 |
| 44639.96875 | 17.32 |
| 44639.979166666664 | 51.52 |
| 44639.989583333336 | 30.12 |
| 44640.0 | 25.87 |
| 44640.010416666664 | 56.42 |
| 44640.020833333336 | 15.02 |
| 44640.03125 | 31.54 |
| 44640.041666666664 | 18.12 |
| 44640.052083333336 | 11.52 |
| 44640.0625 | 11.61 |
| 44640.072916666664 | 9.58 |
| 44640.083333333336 | 8.82 |
| 44640.09375 | 8.78 |
| 44640.104166666664 | 10.15 |
| 44640.114583333336 | 7.47 |
| 44640.125 | 7.39 |
| 44640.135416666664 | 6.53 |
| 44640.145833333336 | 5.96 |
| 44640.15625 | 5.89 |
| 44640.166666666664 | 6.06 |
| 44640.177083333336 | 10.19 |
| 44640.1875 | 11.94 |
| 44640.197916666664 | 10.26 |
| 44640.208333333336 | 17.15 |
| 44640.21875 | 19.21 |
| 44640.229166666664 | 22.92 |
| 44640.239583333336 | 24.76 |
| 44640.25 | 21.59 |
| 44640.260416666664 | 30.12 |
| 44640.270833333336 | 27.75 |
| 44640.28125 | 29.28 |
| 44640.291666666664 | 30.78 |
| 44640.302083333336 | 27.6 |
| 44640.3125 | 24.41 |
| 44640.322916666664 | 27.72 |
| 44640.333333333336 | 24.4 |
| 44640.34375 | 24.23 |
| 44640.354166666664 | 21.42 |
| 44640.364583333336 | 18.92 |
| 44640.375 | 16.84 |
| 44640.385416666664 | 14.44 |
| 44640.395833333336 | 15.66 |
| 44640.40625 | 14.87 |
| 44640.416666666664 | 16.4 |
| 44640.427083333336 | 19.1 |
| 44640.4375 | 33.93 |
| 44640.447916666664 | 18.94 |
| 44640.458333333336 | 15.47 |
| 44640.46875 | 13.42 |
| 44640.479166666664 | 15.18 |
| 44640.489583333336 | 10.83 |
| 44640.5 | 12.52 |
| 44640.510416666664 | 10.34 |
| 44640.520833333336 | 14.6 |
| 44640.53125 | 12.7 |
| 44640.541666666664 | 12.83 |
| 44640.552083333336 | 16.15 |
| 44640.5625 | 11.82 |
| 44640.572916666664 | 18.17 |
| 44640.583333333336 | 12.7 |
| 44640.59375 | 9.29 |
| 44640.604166666664 | 8.55 |
| 44640.614583333336 | 7.41 |
| 44640.625 | 7.96 |
| 44640.635416666664 | 6.86 |
| 44640.645833333336 | 6.15 |
| 44640.65625 | 6.25 |
| 44640.666666666664 | 6.01 |
| 44640.677083333336 | 6.05 |
| 44640.6875 | 7.18 |
| 44640.697916666664 | 7.72 |
| 44640.708333333336 | 8.59 |
| 44640.71875 | 10.82 |
| 44640.729166666664 | 13.91 |
| 44640.739583333336 | 13.69 |
| 44640.75 | 16.38 |
| 44640.760416666664 | 27.97 |
| 44640.770833333336 | 21.62 |
| 44640.78125 | 21.78 |
| 44640.791666666664 | 20.46 |
| 44640.802083333336 | 19.21 |
| 44640.8125 | 18.47 |
| 44640.822916666664 | 16.92 |
| 44640.833333333336 | 16.03 |
| 44640.84375 | 15.58 |
| 44640.854166666664 | 14.43 |
| 44640.864583333336 | 13.95 |
| 44640.875 | 12.09 |
| 44640.885416666664 | 11.71 |
| 44640.895833333336 | 11.56 |
| 44640.90625 | 11.63 |
| 44640.916666666664 | 12.23 |
| 44640.927083333336 | 11.12 |
| 44640.9375 | 15.28 |
| 44640.947916666664 | 14.59 |
| 44640.958333333336 | 11.47 |
| 44640.96875 | 12.22 |
| 44640.979166666664 | 719.77 |
| 44640.989583333336 | 12.26 |
| 44641.0 | 20.61 |
| 44641.010416666664 | 81.72 |
| 44641.020833333336 | 12.31 |
| 44641.03125 | 9.8 |
| 44641.041666666664 | 11.96 |
| 44641.052083333336 | 14.54 |
| 44641.0625 | 13.86 |
| 44641.072916666664 | 11.99 |
| 44641.083333333336 | 13.26 |
| 44641.09375 | 10.98 |
| 44641.104166666664 | 14.06 |
| 44641.114583333336 | 14.02 |
| 44641.125 | 10.51 |
| 44641.135416666664 | 10.64 |
| 44641.145833333336 | 9.73 |
| 44641.15625 | 8.92 |
| 44641.166666666664 | 7.11 |
| 44641.177083333336 | 7.42 |
| 44641.1875 | 6.88 |
| 44641.197916666664 | 8.07 |
| 44641.208333333336 | 10.42 |
| 44641.21875 | 12.93 |
| 44641.229166666664 | 15.65 |
| 44641.239583333336 | 18.39 |
| 44641.25 | 18.03 |
| 44641.260416666664 | 19.48 |
| 44641.270833333336 | 23.67 |
| 44641.28125 | 20.74 |
| 44641.291666666664 | 25.33 |
| 44641.302083333336 | 26.93 |
| 44641.3125 | 25.45 |
| 44641.322916666664 | 23.96 |
| 44641.333333333336 | 23.37 |
| 44641.34375 | 19.29 |
| 44641.354166666664 | 19.87 |
| 44641.364583333336 | 20.59 |
| 44641.375 | 19.31 |
| 44641.385416666664 | 17.46 |
| 44641.395833333336 | 16.08 |
| 44641.40625 | 14.26 |
| 44641.416666666664 | 12.9 |
| 44641.427083333336 | 17.19 |
| 44641.4375 | 15.26 |
| 44641.447916666664 | 16.08 |
| 44641.458333333336 | 18.85 |
| 44641.46875 | 43.52 |
| 44641.479166666664 | 16.83 |
| 44641.489583333336 | 34.03 |
| 44641.5 | 14.84 |
| 44641.510416666664 | 11.02 |
| 44641.520833333336 | 22.03 |
| 44641.53125 | 8.81 |
| 44641.541666666664 | 10.46 |
| 44641.552083333336 | 9.21 |
| 44641.5625 | 19.15 |
| 44641.572916666664 | 9.97 |
| 44641.583333333336 | 9.13 |
| 44641.59375 | 9.07 |
| 44641.604166666664 | 7.42 |
| 44641.614583333336 | 8.67 |
| 44641.625 | 6.57 |
| 44641.635416666664 | 6.13 |
| 44641.645833333336 | 7.31 |
| 44641.65625 | 6.12 |
| 44641.666666666664 | 6.31 |
| 44641.677083333336 | 5.64 |
| 44641.6875 | 5.47 |
| 44641.697916666664 | 5.61 |
| 44641.708333333336 | 6.6 |
| 44641.71875 | 6.83 |
| 44641.729166666664 | 7.38 |
| 44641.739583333336 | 9.53 |
| 44641.75 | 8.03 |
| 44641.760416666664 | 9.93 |
| 44641.770833333336 | 10.93 |
| 44641.78125 | 12.28 |
| 44641.791666666664 | 10.7 |
| 44641.802083333336 | 10.73 |
| 44641.8125 | 11.97 |
| 44641.822916666664 | 10.22 |
| 44641.833333333336 | 9.21 |
| 44641.84375 | 11.84 |
| 44641.854166666664 | 11.35 |
| 44641.864583333336 | 12.05 |
| 44641.875 | 11.89 |
| 44641.885416666664 | 12.12 |
| 44641.895833333336 | 12.57 |
| 44641.90625 | 11.86 |
| 44641.916666666664 | 9.74 |
| 44641.927083333336 | 9.38 |
| 44641.9375 | 199.62 |
| 44641.947916666664 | 8.38 |
| 44641.958333333336 | 9.46 |
| 44641.96875 | 11.37 |
| 44641.979166666664 | 12.27 |
| 44641.989583333336 | 9.89 |
| 44642.0 | 10.3 |
| 44642.010416666664 | 11.78 |
| 44642.020833333336 | 7.66 |
| 44642.03125 | 519.06 |
| 44642.041666666664 | 10.75 |
| 44642.052083333336 | 8.79 |
| 44642.0625 | 18.89 |
| 44642.072916666664 | 14.95 |
| 44642.083333333336 | 10.18 |
| 44642.09375 | 42.43 |
| 44642.104166666664 | 9.3 |
| 44642.114583333336 | 175.1 |
| 44642.125 | 8.1 |
| 44642.135416666664 | 40 |
| 44642.145833333336 | 8.24 |
| 44642.15625 | 7.17 |
| 44642.166666666664 | 6.8 |
| 44642.177083333336 | 5.98 |
| 44642.1875 | 5.9 |
| 44642.197916666664 | 5.66 |
| 44642.208333333336 | 5.48 |
| 44642.21875 | 5.63 |
| 44642.229166666664 | 5.76 |
| 44642.239583333336 | 8.92 |
| 44642.25 | 9.31 |
| 44642.260416666664 | 11.96 |
| 44642.270833333336 | 13.52 |
| 44642.28125 | 16.85 |
| 44642.291666666664 | 14.3 |
| 44642.302083333336 | 17.73 |
| 44642.3125 | 17.69 |
| 44642.322916666664 | 18.09 |
| 44642.333333333336 | 20.41 |
| 44642.34375 | 20.18 |
| 44642.354166666664 | 18.79 |
| 44642.364583333336 | 18.65 |
| 44642.375 | 19.16 |
| 44642.385416666664 | 16.69 |
| 44642.395833333336 | 16.21 |
| 44642.40625 | 18.29 |
| 44642.416666666664 | 16.52 |
| 44642.427083333336 | 15.61 |
| 44642.4375 | 14.8 |
| 44642.447916666664 | 41.64 |
| 44642.458333333336 | 12.22 |
| 44642.46875 | 44.68 |
| 44642.479166666664 | 16.31 |
| 44642.489583333336 | 215.39 |
| 44642.5 | 18.14 |
| 44642.510416666664 | 16.4 |
| 44642.520833333336 | 13.82 |
| 44642.53125 | 12.85 |
| 44642.541666666664 | 20.05 |
| 44642.552083333336 | 10.63 |
| 44642.5625 | 57.85 |
| 44642.572916666664 | 7.71 |
| 44642.583333333336 | 9.18 |
| 44642.59375 | 124.5 |
| 44642.604166666664 | 5.98 |
| 44642.614583333336 | 9.18 |
| 44642.625 | 83.59 |
| 44642.635416666664 | 99.37 |
| 44642.645833333336 | 9.32 |
| 44642.65625 | 7.08 |
| 44642.666666666664 | 6.14 |
| 44642.677083333336 | 8.63 |
| 44642.6875 | 6.01 |
| 44642.697916666664 | 5.63 |
| 44642.708333333336 | 5.04 |
| 44642.71875 | 5.03 |
| 44642.729166666664 | 5.22 |
| 44642.739583333336 | 5.57 |
| 44642.75 | 6.79 |
| 44642.760416666664 | 6.7 |
| 44642.770833333336 | 7.61 |
| 44642.78125 | 8.46 |
| 44642.791666666664 | 8.53 |
| 44642.802083333336 | 9.43 |
| 44642.8125 | 10.28 |
| 44642.822916666664 | 10.75 |
| 44642.833333333336 | 11.58 |
| 44642.84375 | 12.27 |
| 44642.854166666664 | 13.14 |
| 44642.864583333336 | 12.87 |
| 44642.875 | 12.49 |
| 44642.885416666664 | 12.11 |
| 44642.895833333336 | 11.22 |
| 44642.90625 | 10.73 |
| 44642.916666666664 | 10.77 |
| 44642.927083333336 | 11.41 |
| 44642.9375 | 10.56 |
| 44642.947916666664 | 8.04 |
| 44642.958333333336 | 9.76 |
| 44642.96875 | 9.62 |
| 44642.979166666664 | 12.29 |
| 44642.989583333336 | 11.12 |
| 44643.0 | 9.86 |
| 44643.010416666664 | 8.21 |
| 44643.020833333336 | 40 |
| 44643.03125 | 9.38 |
| 44643.041666666664 | 8.2 |
| 44643.052083333336 | 16 |
| 44643.0625 | 10.6 |
| 44643.072916666664 | 9.22 |
| 44643.083333333336 | 8.35 |
| 44643.09375 | 22.11 |
| 44643.104166666664 | 7.7 |
| 44643.114583333336 | 5.66 |
| 44643.125 | 12.29 |
| 44643.135416666664 | 78.63 |
| 44643.145833333336 | 6.04 |
| 44643.15625 | 14.9 |
| 44643.166666666664 | 6.59 |
| 44643.177083333336 | 10.31 |
| 44643.1875 | 5.31 |
| 44643.197916666664 | 4.83 |
| 44643.208333333336 | 4.73 |
| 44643.21875 | 7.53 |
| 44643.229166666664 | 4.35 |
| 44643.239583333336 | 5.13 |
| 44643.25 | 4.33 |
| 44643.260416666664 | 4.33 |
| 44643.270833333336 | 4.45 |
| 44643.28125 | 5.88 |
| 44643.291666666664 | 5.67 |
| 44643.302083333336 | 10.65 |
| 44643.3125 | 17.49 |
| 44643.322916666664 | 10.01 |
| 44643.333333333336 | 15.53 |
| 44643.34375 | 18.82 |
| 44643.354166666664 | 16.6 |
| 44643.364583333336 | 20.64 |
| 44643.375 | 19.37 |
| 44643.385416666664 | 21.04 |
| 44643.395833333336 | 18.27 |
| 44643.40625 | 18.95 |
| 44643.416666666664 | 18.95 |
| 44643.427083333336 | 17.82 |
| 44643.4375 | 18.87 |
| 44643.447916666664 | 13.51 |
| 44643.458333333336 | 14.56 |
| 44643.46875 | 12.66 |
| 44643.479166666664 | 10.81 |
| 44643.489583333336 | 258.84 |
| 44643.5 | 10.76 |
| 44643.510416666664 | 16.14 |
| 44643.520833333336 | 11.55 |
| 44643.53125 | 12.56 |
| 44643.541666666664 | 12.09 |
| 44643.552083333336 | 132.2 |
| 44643.5625 | 519.01 |
| 44643.572916666664 | 9.83 |
| 44643.583333333336 | 11.54 |
| 44643.59375 | 68.51 |
| 44643.604166666664 | 9.26 |
| 44643.614583333336 | 45.93 |
| 44643.625 | 6.98 |
| 44643.635416666664 | 6.85 |
| 44643.645833333336 | 5.55 |
| 44643.65625 | 6.46 |
| 44643.666666666664 | 5.03 |
| 44643.677083333336 | 5.43 |
| 44643.6875 | 5.14 |
| 44643.697916666664 | 4.74 |
| 44643.708333333336 | 5.65 |
| 44643.71875 | 8.57 |
| 44643.729166666664 | 10.94 |
| 44643.739583333336 | 3.76 |
| 44643.75 | 5.72 |
| 44643.760416666664 | 5.17 |
| 44643.770833333336 | 5.07 |
| 44643.78125 | 5.48 |
| 44643.791666666664 | 9.09 |
| 44643.802083333336 | 6.61 |
| 44643.8125 | 8.67 |
| 44643.822916666664 | 6.65 |
| 44643.833333333336 | 9.69 |
| 44643.84375 | 12.84 |
| 44643.854166666664 | 11.67 |
| 44643.864583333336 | 10.62 |
| 44643.875 | 12.15 |
| 44643.885416666664 | 13.09 |
| 44643.895833333336 | 12.7 |
| 44643.90625 | 8.97 |
| 44643.916666666664 | 8.84 |
| 44643.927083333336 | 9.31 |
| 44643.9375 | 10.99 |
| 44643.947916666664 | 9.07 |
| 44643.958333333336 | 9.88 |
| 44643.96875 | 35.61 |
| 44643.979166666664 | 9.43 |
| 44643.989583333336 | 523.33 |
| 44644.0 | 12.76 |
| 44644.010416666664 | 9.63 |
| 44644.020833333336 | 10.9 |
| 44644.03125 | 297.42 |
| 44644.041666666664 | 13.96 |
| 44644.052083333336 | 27.09 |
| 44644.0625 | 58.3 |
| 44644.072916666664 | 19.93 |
| 44644.083333333336 | 43.5 |
| 44644.09375 | 31.32 |
| 44644.104166666664 | 185.66 |
| 44644.114583333336 | 26.51 |
| 44644.125 | 29.96 |
| 44644.135416666664 | 36.99 |
| 44644.145833333336 | 143.53 |
| 44644.15625 | 391.46 |
| 44644.166666666664 | 25.33 |
| 44644.177083333336 | 19.32 |
| 44644.1875 | 16.77 |
| 44644.197916666664 | 19.35 |
| 44644.208333333336 | 15.8 |
| 44644.21875 | 12.57 |
| 44644.229166666664 | 12.5 |
| 44644.239583333336 | 26.09 |
| 44644.25 | 11.48 |
| 44644.260416666664 | 111.48 |
| 44644.270833333336 | 25.67 |
| 44644.28125 | 7.33 |
| 44644.291666666664 | 10.46 |
| 44644.302083333336 | 7.74 |
| 44644.3125 | 8.89 |
| 44644.322916666664 | 12.89 |
| 44644.333333333336 | 8.44 |
| 44644.34375 | 10.02 |
| 44644.354166666664 | 9.11 |
| 44644.364583333336 | 9.67 |
| 44644.375 | 13.82 |
| 44644.385416666664 | 13.9 |
| 44644.395833333336 | 14.94 |
| 44644.40625 | 14.25 |
| 44644.416666666664 | 70.47 |
| 44644.427083333336 | 16.58 |
| 44644.4375 | 18.33 |
| 44644.447916666664 | 18.78 |
| 44644.458333333336 | 20.5 |
| 44644.46875 | 17.97 |
| 44644.479166666664 | 16.11 |
| 44644.489583333336 | 18.41 |
| 44644.5 | 30.55 |
| 44644.510416666664 | 39.13 |
| 44644.520833333336 | 41.37 |
| 44644.53125 | 54.67 |
| 44644.541666666664 | 59.73 |
| 44644.552083333336 | 43.27 |
| 44644.5625 | 60.72 |
| 44644.572916666664 | 31.45 |
| 44644.583333333336 | 33.96 |
| 44644.59375 | 27.36 |
| 44644.604166666664 | 31.28 |
| 44644.614583333336 | 26.88 |
| 44644.625 | 19.59 |
| 44644.635416666664 | 21.77 |
| 44644.645833333336 | 23.01 |
| 44644.65625 | 30.04 |
| 44644.666666666664 | 16 |
| 44644.677083333336 | 16.07 |
| 44644.6875 | 18.63 |
| 44644.697916666664 | 16.34 |
| 44644.708333333336 | 16 |
| 44644.71875 | 14.1 |
| 44644.729166666664 | 14.71 |
| 44644.739583333336 | 13.43 |
| 44644.75 | 12.58 |
| 44644.760416666664 | 11.96 |
| 44644.770833333336 | 471.55 |
| 44644.78125 | 15.51 |
| 44644.791666666664 | 450.89 |
| 44644.802083333336 | 13.38 |
| 44644.8125 | 14.46 |
| 44644.822916666664 | 19.07 |
| 44644.833333333336 | 84.59 |
| 44644.84375 | 40.02 |
| 44644.854166666664 | 42.58 |
| 44644.864583333336 | 38.43 |
| 44644.875 | 39.86 |
| 44644.885416666664 | 42.69 |
| 44644.895833333336 | 42.72 |
| 44644.90625 | 41.21 |
| 44644.916666666664 | 37.74 |
| 44644.927083333336 | 36.2 |
| 44644.9375 | 39.22 |
| 44644.947916666664 | 33.88 |
| 44644.958333333336 | 31.86 |
| 44644.96875 | 35.85 |
| 44644.979166666664 | 37.14 |
| 44644.989583333336 | 36.62 |
| 44645.0 | 34.63 |
| 44645.010416666664 | 35.62 |
| 44645.020833333336 | 40.41 |
| 44645.03125 | 32.2 |
| 44645.041666666664 | 35.21 |
| 44645.052083333336 | 31.1 |
| 44645.0625 | 30.89 |
| 44645.072916666664 | 150.89 |
| 44645.083333333336 | 27.97 |
| 44645.09375 | 37.14 |
| 44645.104166666664 | 33.3 |
| 44645.114583333336 | 29.2 |
| 44645.125 | 33.37 |
| 44645.135416666664 | 32.42 |
| 44645.145833333336 | 31.26 |
| 44645.15625 | 20.11 |
| 44645.166666666664 | 21.44 |
| 44645.177083333336 | 22.01 |
| 44645.1875 | 21.13 |
| 44645.197916666664 | 18.65 |
| 44645.208333333336 | 19.17 |
| 44645.21875 | 16.08 |
| 44645.229166666664 | 17.89 |
| 44645.239583333336 | 13.56 |
| 44645.25 | 15.04 |
| 44645.260416666664 | 10.7 |
| 44645.270833333336 | 11.09 |
| 44645.28125 | 705.39 |
| 44645.291666666664 | 9.5 |
| 44645.302083333336 | 8.75 |
| 44645.3125 | 8.38 |
| 44645.322916666664 | 8.85 |
| 44645.333333333336 | 8.09 |
| 44645.34375 | 30.07 |
| 44645.354166666664 | 10.24 |
| 44645.364583333336 | 10.19 |
| 44645.375 | 10.6 |
| 44645.385416666664 | 20.59 |
| 44645.395833333336 | 23.64 |
| 44645.40625 | 138.76 |
| 44645.416666666664 | 155.62 |
| 44645.427083333336 | 37.55 |
| 44645.4375 | 37.62 |
| 44645.447916666664 | 24.78 |
| 44645.458333333336 | 33.33 |
| 44645.46875 | 31.14 |
| 44645.479166666664 | 32.14 |
| 44645.489583333336 | 34.95 |
| 44645.5 | 36.77 |
| 44645.510416666664 | 35.38 |
| 44645.520833333336 | 34.07 |
| 44645.53125 | 31.66 |
| 44645.541666666664 | 29.59 |
| 44645.552083333336 | 25.38 |
| 44645.5625 | 24.48 |
| 44645.572916666664 | 24.03 |
| 44645.583333333336 | 30.34 |
| 44645.59375 | 25.05 |
| 44645.604166666664 | 22.39 |
| 44645.614583333336 | 24.9 |
| 44645.625 | 19.06 |
| 44645.635416666664 | 19.98 |
| 44645.645833333336 | 18.07 |
| 44645.65625 | 17.64 |
| 44645.666666666664 | 17.31 |
| 44645.677083333336 | 17.34 |
| 44645.6875 | 11.46 |
| 44645.697916666664 | 12.04 |
| 44645.708333333336 | 9.58 |
| 44645.71875 | 1135.01 |
| 44645.729166666664 | 13.97 |
| 44645.739583333336 | 8.73 |
| 44645.75 | 10.31 |
| 44645.760416666664 | 9.13 |
| 44645.770833333336 | 8.1 |
| 44645.78125 | 11.07 |
| 44645.791666666664 | 7.5 |
| 44645.802083333336 | 398.27 |
| 44645.8125 | 6.54 |
| 44645.822916666664 | 5.3 |
| 44645.833333333336 | 5.96 |
| 44645.84375 | 5.65 |
| 44645.854166666664 | 5.89 |
| 44645.864583333336 | 7.6 |
| 44645.875 | 9.38 |
| 44645.885416666664 | 12.64 |
| 44645.895833333336 | 12.97 |
| 44645.90625 | 11.12 |
| 44645.916666666664 | 11.25 |
| 44645.927083333336 | 13.02 |
| 44645.9375 | 13.81 |
| 44645.947916666664 | 14.09 |
| 44645.958333333336 | 14.74 |
| 44645.96875 | 14.13 |
| 44645.979166666664 | 21.84 |
| 44645.989583333336 | 13.87 |
| 44646.0 | 14.5 |
| 44646.010416666664 | 15.23 |
| 44646.020833333336 | 14.88 |
| 44646.03125 | 17.7 |
| 44646.041666666664 | 16.61 |
| 44646.052083333336 | 17.52 |
| 44646.0625 | 18.41 |
| 44646.072916666664 | 16.94 |
| 44646.083333333336 | 17.91 |
| 44646.09375 | 16.83 |
| 44646.104166666664 | 19.45 |
| 44646.114583333336 | 15.5 |
| 44646.125 | 15.28 |
| 44646.135416666664 | 16.21 |
| 44646.145833333336 | 17.4 |
| 44646.15625 | 15.08 |
| 44646.166666666664 | 14.33 |
| 44646.177083333336 | 16.44 |
| 44646.1875 | 14.45 |
| 44646.197916666664 | 14.64 |
| 44646.208333333336 | 12.01 |
| 44646.21875 | 11.68 |
| 44646.229166666664 | 11.24 |
| 44646.239583333336 | 9.35 |
| 44646.25 | 9.3 |
| 44646.260416666664 | 8.43 |
| 44646.270833333336 | 8.08 |
| 44646.28125 | 8.96 |
| 44646.291666666664 | 7.96 |
| 44646.302083333336 | 7.14 |
| 44646.3125 | 6.79 |
| 44646.322916666664 | 6.48 |
| 44646.333333333336 | 6.15 |
| 44646.34375 | 6.42 |
| 44646.354166666664 | 6.22 |
| 44646.364583333336 | 6 |
| 44646.375 | 5.64 |
| 44646.385416666664 | 5.24 |
| 44646.395833333336 | 5.65 |
| 44646.40625 | 7.18 |
| 44646.416666666664 | 8.05 |
| 44646.427083333336 | 9.23 |
| 44646.4375 | 12.58 |
| 44646.447916666664 | 11.57 |
| 44646.458333333336 | 10.76 |
| 44646.46875 | 12.33 |
| 44646.479166666664 | 97.33 |
| 44646.489583333336 | 13.77 |
| 44646.5 | 13.31 |
| 44646.510416666664 | 16.25 |
| 44646.520833333336 | 18.09 |
| 44646.53125 | 18.99 |
| 44646.541666666664 | 20.7 |
| 44646.552083333336 | 21.97 |
| 44646.5625 | 17.8 |
| 44646.572916666664 | 16.06 |
| 44646.583333333336 | 15.89 |
| 44646.59375 | 16.47 |
| 44646.604166666664 | 13.96 |
| 44646.614583333336 | 1439.07 |
| 44646.625 | 117.71 |
| 44646.635416666664 | 15.04 |
| 44646.645833333336 | 14.48 |
| 44646.65625 | 13.89 |
| 44646.666666666664 | 13.92 |
| 44646.677083333336 | 12.71 |
| 44646.6875 | 312.14 |
| 44646.697916666664 | 14.79 |
| 44646.708333333336 | 41.15 |
| 44646.71875 | 15.99 |
| 44646.729166666664 | 13.93 |
| 44646.739583333336 | 13.98 |
| 44646.75 | 12.07 |
| 44646.760416666664 | 12.24 |
| 44646.770833333336 | 70.9 |
| 44646.78125 | 411.5 |
| 44646.791666666664 | 23.49 |
| 44646.802083333336 | 21.67 |
| 44646.8125 | 19.11 |
| 44646.822916666664 | 14.97 |
| 44646.833333333336 | 14.32 |
| 44646.84375 | 12.91 |
| 44646.854166666664 | 17.53 |
| 44646.864583333336 | 10.84 |
| 44646.875 | 9.6 |
| 44646.885416666664 | 10.83 |
| 44646.895833333336 | 11.24 |
| 44646.90625 | 10.97 |
| 44646.916666666664 | 12.22 |
| 44646.927083333336 | 11.71 |
| 44646.9375 | 11.41 |
| 44646.947916666664 | 11.72 |
| 44646.958333333336 | 11.83 |
| 44646.96875 | 12.42 |
| 44646.979166666664 | 15.97 |
| 44646.989583333336 | 11.75 |
| 44647.0 | 12.77 |
| 44647.010416666664 | 16.03 |
| 44647.020833333336 | 13.84 |
| 44647.03125 | 13.42 |
| 44647.041666666664 | 14.97 |
| 44647.052083333336 | 16.29 |
| 44647.0625 | 16.87 |
| 44647.072916666664 | 17.9 |
| 44647.083333333336 | 17.47 |
| 44647.09375 | 19.16 |
| 44647.104166666664 | 18.86 |
| 44647.114583333336 | 18.78 |
| 44647.125 | 19.45 |
| 44647.135416666664 | 18.37 |
| 44647.145833333336 | 17.08 |
| 44647.15625 | 49.59 |
| 44647.166666666664 | 380.95 |
| 44647.177083333336 | 15.84 |
| 44647.1875 | 15.75 |
| 44647.197916666664 | 16.81 |
| 44647.208333333336 | 249.85 |
| 44647.21875 | 14.93 |
| 44647.229166666664 | 13.44 |
| 44647.239583333336 | 13.71 |
| 44647.25 | 15.33 |
| 44647.260416666664 | 10.42 |
| 44647.270833333336 | 20.56 |
| 44647.28125 | 167.96 |
| 44647.291666666664 | 11.78 |
| 44647.302083333336 | 12.14 |
| 44647.3125 | 15.97 |
| 44647.322916666664 | 10.84 |
| 44647.333333333336 | 11.46 |
| 44647.34375 | 22.59 |
| 44647.354166666664 | 10.98 |
| 44647.364583333336 | 10.74 |
| 44647.375 | 10.18 |
| 44647.385416666664 | 9.56 |
| 44647.395833333336 | 9.98 |
| 44647.40625 | 9.26 |
| 44647.416666666664 | 9.92 |
| 44647.427083333336 | 8.84 |
| 44647.4375 | 8.02 |
| 44647.447916666664 | 7.59 |
| 44647.458333333336 | 8.79 |
| 44647.46875 | 10.54 |
| 44647.479166666664 | 9.13 |
| 44647.489583333336 | 10.53 |
| 44647.5 | 13.45 |
| 44647.510416666664 | 12.62 |
| 44647.520833333336 | 12.58 |
| 44647.53125 | 15.6 |
| 44647.541666666664 | 17.9 |
| 44647.552083333336 | 20.35 |
| 44647.5625 | 20.59 |
| 44647.572916666664 | 21.48 |
| 44647.583333333336 | 21.84 |
| 44647.59375 | 21.99 |
| 44647.604166666664 | 21.36 |
| 44647.614583333336 | 20.29 |
| 44647.625 | 428.05 |
| 44647.635416666664 | 19.19 |
| 44647.645833333336 | 18.24 |
| 44647.65625 | 17 |
| 44647.666666666664 | 16.21 |
| 44647.677083333336 | 16.55 |
| 44647.6875 | 145.35 |
| 44647.697916666664 | 561.54 |
| 44647.708333333336 | 38.68 |
| 44647.71875 | 17.01 |
| 44647.729166666664 | 13.81 |
| 44647.739583333336 | 11.4 |
| 44647.75 | 12.26 |
| 44647.760416666664 | 10.74 |
| 44647.770833333336 | 8.91 |
| 44647.78125 | 10.18 |
| 44647.791666666664 | 7.89 |
| 44647.802083333336 | 7.53 |
| 44647.8125 | 6.57 |
| 44647.822916666664 | 6.29 |
| 44647.833333333336 | 7.01 |
| 44647.84375 | 6.18 |
| 44647.854166666664 | 8.15 |
| 44647.864583333336 | 6 |
| 44647.875 | 10.83 |
| 44647.885416666664 | 5.88 |
| 44647.895833333336 | 5.75 |
| 44647.90625 | 5.51 |
| 44647.916666666664 | 7.68 |
| 44647.927083333336 | 5.89 |
| 44647.9375 | 5.75 |
| 44647.947916666664 | 5.22 |
| 44647.958333333336 | 4.82 |
| 44647.96875 | 5.13 |
| 44647.979166666664 | 5.34 |
| 44647.989583333336 | 6.71 |
| 44648.0 | 6.87 |
| 44648.010416666664 | 7.88 |
| 44648.020833333336 | 9.79 |
| 44648.03125 | 11.25 |
| 44648.041666666664 | 12.19 |
| 44648.052083333336 | 18.04 |
| 44648.0625 | 14.38 |
| 44648.072916666664 | 18 |
| 44648.083333333336 | 19.48 |
| 44648.09375 | 20.25 |
| 44648.104166666664 | 20.08 |
| 44648.114583333336 | 20.34 |
| 44648.125 | 21.18 |
| 44648.135416666664 | 21.76 |
| 44648.145833333336 | 22.94 |
| 44648.15625 | 20.3 |
| 44648.166666666664 | 22.02 |
| 44648.177083333336 | 18.78 |
| 44648.1875 | 18.83 |
| 44648.197916666664 | 16.97 |
| 44648.208333333336 | 48.14 |
| 44648.21875 | 23.91 |
| 44648.229166666664 | 21.76 |
| 44648.239583333336 | 189.77 |
| 44648.25 | 24.86 |
| 44648.260416666664 | 737.69 |
| 44648.270833333336 | 22.78 |
| 44648.28125 | 19.38 |
| 44648.291666666664 | 21.35 |
| 44648.302083333336 | 20.74 |
| 44648.3125 | 23.49 |
| 44648.322916666664 | 25.46 |
| 44648.333333333336 | 27.62 |
| 44648.34375 | 26.71 |
| 44648.354166666664 | 28.11 |
| 44648.364583333336 | 32.06 |
| 44648.375 | 378.22 |
| 44648.385416666664 | 23.57 |
| 44648.395833333336 | 26.31 |
| 44648.40625 | 17.74 |
| 44648.416666666664 | 17.06 |
| 44648.427083333336 | 15.63 |
| 44648.4375 | 14.18 |
| 44648.447916666664 | 12.99 |
| 44648.458333333336 | 11.45 |
| 44648.46875 | 12.65 |
| 44648.479166666664 | 12.32 |
| 44648.489583333336 | 10.23 |
| 44648.5 | 9.33 |
| 44648.510416666664 | 9.66 |
| 44648.520833333336 | 10.28 |
| 44648.53125 | 36.64 |
| 44648.541666666664 | 11.8 |
| 44648.552083333336 | 12.87 |
| 44648.5625 | 12.21 |
| 44648.572916666664 | 14.24 |
| 44648.583333333336 | 12.72 |
| 44648.59375 | 23.37 |
| 44648.604166666664 | 27.62 |
| 44648.614583333336 | 26.06 |
| 44648.625 | 30.49 |
| 44648.635416666664 | 27.85 |
| 44648.645833333336 | 27.71 |
| 44648.65625 | 22.91 |
| 44648.666666666664 | 21.56 |
| 44648.677083333336 | 18.7 |
| 44648.6875 | 18.25 |
| 44648.697916666664 | 52.22 |
| 44648.708333333336 | 16.49 |
| 44648.71875 | 17.94 |
| 44648.729166666664 | 16.94 |
| 44648.739583333336 | 25.45 |
| 44648.75 | 86.17 |
| 44648.760416666664 | 15.71 |
| 44648.770833333336 | 571.44 |
| 44648.78125 | 12.16 |
| 44648.791666666664 | 11.62 |
| 44648.802083333336 | 10.72 |
| 44648.8125 | 10.27 |
| 44648.822916666664 | 10.9 |
| 44648.833333333336 | 9.85 |
| 44648.84375 | 8.94 |
| 44648.854166666664 | 28.3 |
| 44648.864583333336 | 8.1 |
| 44648.875 | 9.12 |
| 44648.885416666664 | 7.39 |
| 44648.895833333336 | 6.65 |
| 44648.90625 | 70.82 |
| 44648.916666666664 | 6.63 |
| 44648.927083333336 | 6.55 |
| 44648.9375 | 6.07 |
| 44648.947916666664 | 15.45 |
| 44648.958333333336 | 5.77 |
| 44648.96875 | 5.72 |
| 44648.979166666664 | 5.61 |
| 44648.989583333336 | 6.45 |
| 44649.0 | 8.41 |
| 44649.010416666664 | 9.77 |
| 44649.020833333336 | 11.44 |
| 44649.03125 | 17.98 |
| 44649.041666666664 | 26.41 |
| 44649.052083333336 | 32.26 |
| 44649.0625 | 47.54 |
| 44649.072916666664 | 47.99 |
| 44649.083333333336 | 46.92 |
| 44649.09375 | 44.63 |
| 44649.104166666664 | 42.89 |
| 44649.114583333336 | 42.61 |
| 44649.125 | 38.65 |
| 44649.135416666664 | 33.72 |
| 44649.145833333336 | 33.98 |
| 44649.15625 | 38.88 |
| 44649.166666666664 | 30.05 |
| 44649.177083333336 | 26.14 |
| 44649.1875 | 23.54 |
| 44649.197916666664 | 259.68 |
| 44649.208333333336 | 23.46 |
| 44649.21875 | 23.1 |
| 44649.229166666664 | 20.5 |
| 44649.239583333336 | 20.73 |
| 44649.25 | 31.59 |
| 44649.260416666664 | 27.07 |
| 44649.270833333336 | 24.79 |
| 44649.28125 | 27.17 |
| 44649.291666666664 | 24.68 |
| 44649.302083333336 | 1180.12 |
| 44649.3125 | 25.86 |
| 44649.322916666664 | 677.09 |
| 44649.333333333336 | 18.49 |
| 44649.34375 | 17.33 |
| 44649.354166666664 | 13.94 |
| 44649.364583333336 | 19.83 |
| 44649.375 | 17.74 |
| 44649.385416666664 | 15.64 |
| 44649.395833333336 | 12.06 |
| 44649.40625 | 14.14 |
| 44649.416666666664 | 899.75 |
| 44649.427083333336 | 14.51 |
| 44649.4375 | 660.23 |
| 44649.447916666664 | 12.44 |
| 44649.458333333336 | 12.82 |
| 44649.46875 | 12.49 |
| 44649.479166666664 | 11.99 |
| 44649.489583333336 | 10.92 |
| 44649.5 | 10.28 |
| 44649.510416666664 | 9.63 |
| 44649.520833333336 | 9.48 |
| 44649.53125 | 10.52 |
| 44649.541666666664 | 11.04 |
| 44649.552083333336 | 12.92 |
| 44649.5625 | 13.73 |
| 44649.572916666664 | 12.23 |
| 44649.583333333336 | 13.23 |
| 44649.59375 | 16 |
| 44649.604166666664 | 19.43 |
| 44649.614583333336 | 23.09 |
| 44649.625 | 26.42 |
| 44649.635416666664 | 32.33 |
| 44649.645833333336 | 33.4 |
| 44649.65625 | 33.75 |
| 44649.666666666664 | 31.29 |
| 44649.677083333336 | 26.98 |
| 44649.6875 | 27.85 |
| 44649.697916666664 | 33.07 |
| 44649.708333333336 | 25.24 |
| 44649.71875 | 21.42 |
| 44649.729166666664 | 21.02 |
| 44649.739583333336 | 20.71 |
| 44649.75 | 17.04 |
| 44649.760416666664 | 50.13 |
| 44649.770833333336 | 15.19 |
| 44649.78125 | 16.3 |
| 44649.791666666664 | 16.86 |
| 44649.802083333336 | 18.52 |
| 44649.8125 | 822.43 |
| 44649.822916666664 | 15.06 |
| 44649.833333333336 | 14.4 |
| 44649.84375 | 13.13 |
| 44649.854166666664 | 12.92 |
| 44649.864583333336 | 11.44 |
| 44649.875 | 130.77 |
| 44649.885416666664 | 11.6 |
| 44649.895833333336 | 2061.21 |
| 44649.90625 | 112.32 |
| 44649.916666666664 | 22.8 |
| 44649.927083333336 | 11.99 |
| 44649.9375 | 12.55 |
| 44649.947916666664 | 8.52 |
| 44649.958333333336 | 10.1 |
| 44649.96875 | 8.55 |
| 44649.979166666664 | 8.32 |
| 44649.989583333336 | 8.2 |
| 44650.0 | 7.94 |
| 44650.010416666664 | 7.44 |
| 44650.020833333336 | 7.27 |
| 44650.03125 | 6.85 |
| 44650.041666666664 | 8.93 |
| 44650.052083333336 | 8.31 |
| 44650.0625 | 9.94 |
| 44650.072916666664 | 11.83 |
| 44650.083333333336 | 9.96 |
| 44650.09375 | 11.55 |
| 44650.104166666664 | 17.65 |
| 44650.114583333336 | 20.17 |
| 44650.125 | 23.17 |
| 44650.135416666664 | 22.49 |
| 44650.145833333336 | 21.98 |
| 44650.15625 | 20.2 |
| 44650.166666666664 | 20.94 |
| 44650.177083333336 | 21.2 |
| 44650.1875 | 21.98 |
| 44650.197916666664 | 20.56 |
| 44650.208333333336 | 21.98 |
| 44650.21875 | 18.28 |
| 44650.229166666664 | 18.4 |
| 44650.239583333336 | 18.2 |
| 44650.25 | 22.35 |
| 44650.260416666664 | 15.75 |
| 44650.270833333336 | 120.3 |
| 44650.28125 | 13.53 |
| 44650.291666666664 | 3196.8 |
| 44650.302083333336 | 21.03 |
| 44650.3125 | 54.46 |
| 44650.322916666664 | 19.6 |
| 44650.333333333336 | 18.57 |
| 44650.34375 | 13.16 |
| 44650.354166666664 | 14.74 |
| 44650.364583333336 | 12.13 |
| 44650.375 | 199.33 |
| 44650.385416666664 | 10.41 |
| 44650.395833333336 | 7.77 |
| 44650.40625 | 9.72 |
| 44650.416666666664 | 2910.11 |
| 44650.427083333336 | 1420.37 |
| 44650.4375 | 11.39 |
| 44650.447916666664 | 66.47 |
| 44650.458333333336 | 17.82 |
| 44650.46875 | 126.51 |
| 44650.479166666664 | 60.96 |
| 44650.489583333336 | 6.59 |
| 44650.5 | 8.17 |
| 44650.510416666664 | 5.59 |
| 44650.520833333336 | 5.51 |
| 44650.53125 | 6.43 |
| 44650.541666666664 | 6.6 |
| 44650.552083333336 | 5.1 |
| 44650.5625 | 10.51 |
| 44650.572916666664 | 6.81 |
| 44650.583333333336 | 6.55 |
| 44650.59375 | 6.51 |
| 44650.604166666664 | 5.95 |
| 44650.614583333336 | 10.17 |
| 44650.625 | 7.33 |
| 44650.635416666664 | 11.06 |
| 44650.645833333336 | 11.05 |
| 44650.65625 | 15.18 |
| 44650.666666666664 | 21.22 |
| 44650.677083333336 | 24.66 |
| 44650.6875 | 21.78 |
| 44650.697916666664 | 20.11 |
| 44650.708333333336 | 19.89 |
| 44650.71875 | 19.07 |
| 44650.729166666664 | 23.42 |
| 44650.739583333336 | 20.45 |
| 44650.75 | 20.42 |
| 44650.760416666664 | 18 |
| 44650.770833333336 | 19.37 |
| 44650.78125 | 16.59 |
| 44650.791666666664 | 18.71 |
| 44650.802083333336 | 18.88 |
| 44650.8125 | 16.86 |
| 44650.822916666664 | 15.82 |
| 44650.833333333336 | 14.49 |
| 44650.84375 | 13.82 |
| 44650.854166666664 | 13.14 |
| 44650.864583333336 | 11.75 |
| 44650.875 | 10.8 |
| 44650.885416666664 | 10.59 |
| 44650.895833333336 | 10.92 |
| 44650.90625 | 10.93 |
| 44650.916666666664 | 12.18 |
| 44650.927083333336 | 11.32 |
| 44650.9375 | 9.7 |
| 44650.947916666664 | 9.37 |
| 44650.958333333336 | 8.86 |
| 44650.96875 | 7.87 |
| 44650.979166666664 | 7.57 |
| 44650.989583333336 | 7.54 |
| 44651.0 | 7.6 |
| 44651.010416666664 | 7.31 |
| 44651.020833333336 | 6.92 |
| 44651.03125 | 6.61 |
| 44651.041666666664 | 6.06 |
| 44651.052083333336 | 5.51 |
| 44651.0625 | 5.45 |
| 44651.072916666664 | 5.39 |
| 44651.083333333336 | 5.7 |
| 44651.09375 | 7.51 |
| 44651.104166666664 | 6.62 |
| 44651.114583333336 | 9.12 |
| 44651.125 | 9.11 |
| 44651.135416666664 | 9.23 |
| 44651.145833333336 | 9.63 |
| 44651.15625 | 10.55 |
| 44651.166666666664 | 17.1 |
| 44651.177083333336 | 23.82 |
| 44651.1875 | 29.41 |
| 44651.197916666664 | 28.22 |
| 44651.208333333336 | 30 |
| 44651.21875 | 27.84 |
| 44651.229166666664 | 28.32 |
| 44651.239583333336 | 27.13 |
| 44651.25 | 26.29 |
| 44651.260416666664 | 24.8 |
| 44651.270833333336 | 23.32 |
| 44651.28125 | 22.03 |
| 44651.291666666664 | 22.72 |
| 44651.302083333336 | 19.08 |
| 44651.3125 | 18.77 |
| 44651.322916666664 | 18.16 |
| 44651.333333333336 | 18.38 |
| 44651.34375 | 19.21 |
| 44651.354166666664 | 21.09 |
| 44651.364583333336 | 24.49 |
| 44651.375 | 19.73 |
| 44651.385416666664 | 16.95 |
| 44651.395833333336 | 16.25 |
| 44651.40625 | 17.4 |
| 44651.416666666664 | 16.5 |
| 44651.427083333336 | 17.5 |
| 44651.4375 | 20.56 |
| 44651.447916666664 | 18.93 |
| 44651.458333333336 | 17.18 |
| 44651.46875 | 17.06 |
| 44651.479166666664 | 12.33 |
| 44651.489583333336 | 12.26 |
| 44651.5 | 11.55 |
| 44651.510416666664 | 10.42 |
| 44651.520833333336 | 9.93 |
| 44651.53125 | 9.27 |
| 44651.541666666664 | 8.48 |
| 44651.552083333336 | 8.18 |
| 44651.5625 | 8.23 |
| 44651.572916666664 | 7.52 |
| 44651.583333333336 | 7.12 |
| 44651.59375 | 6.51 |
| 44651.604166666664 | 8.06 |
| 44651.614583333336 | 8.43 |
| 44651.625 | 8.14 |
| 44651.635416666664 | 9.4 |
| 44651.645833333336 | 9.75 |
| 44651.65625 | 10.6 |
| 44651.666666666664 | 11.3 |
| 44651.677083333336 | 15.57 |
| 44651.6875 | 19.7 |
| 44651.697916666664 | 23.4 |
| 44651.708333333336 | 24.8 |
| 44651.71875 | 25 |
| 44651.729166666664 | 24.86 |
| 44651.739583333336 | 24.91 |
| 44651.75 | 25.02 |
| 44651.760416666664 | 24.73 |
| 44651.770833333336 | 24.65 |
| 44651.78125 | 22.56 |
| 44651.791666666664 | 22.22 |
| 44651.802083333336 | 19.92 |
| 44651.8125 | 18.44 |
| 44651.822916666664 | 18.77 |
| 44651.833333333336 | 19.11 |
| 44651.84375 | 18.91 |
| 44651.854166666664 | 24.55 |
| 44651.864583333336 | 29.54 |
| 44651.875 | 35.72 |
| 44651.885416666664 | 50.73 |
| 44651.895833333336 | 53.73 |
| 44651.90625 | 65.18 |
| 44651.916666666664 | 73.11 |
| 44651.927083333336 | 80.98 |
| 44651.9375 | 76.14 |
| 44651.947916666664 | 76.25 |
| 44651.958333333336 | 78.49 |
| 44651.96875 | 72.85 |
| 44651.979166666664 | 69.42 |
| 44651.989583333336 | 66.9 |
| 44652.0 | 66.41 |
| 44652.010416666664 | 64.84 |
| 44652.020833333336 | 54.85 |
| 44652.03125 | 45.63 |
| 44652.041666666664 | 37.18 |
| 44652.052083333336 | 25.79 |
| 44652.0625 | 20.03 |
| 44652.072916666664 | 20.7 |
| 44652.083333333336 | 17.72 |
| 44652.09375 | 17.03 |
| 44652.104166666664 | 18.71 |
| 44652.114583333336 | 18.92 |
| 44652.125 | 22.38 |
| 44652.135416666664 | 19.94 |
| 44652.145833333336 | 25.72 |